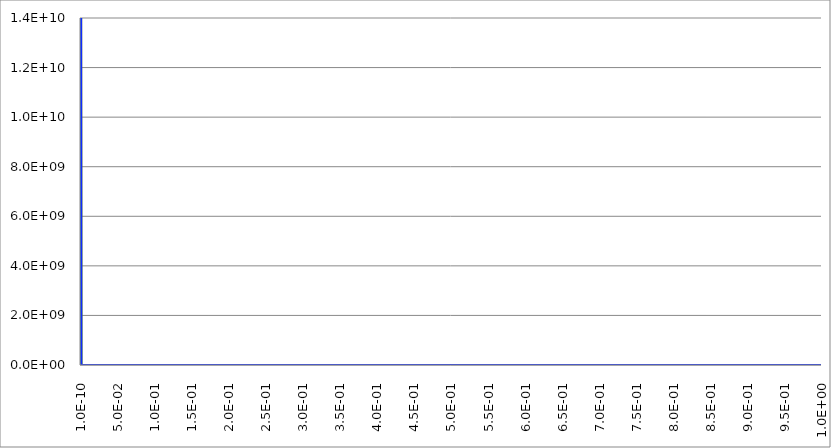
| Category | Series 1 | Series 0 | Series 2 |
|---|---|---|---|
| 1e-10 | 20000000000 | 20000000000 | 20000000000 |
| 0.00050000009995 | 326.933 | 368.54 | 410.147 |
| 0.0010000000999 | 20.619 | 23.219 | 25.82 |
| 0.00150000009985 | 4.085 | 4.599 | 5.113 |
| 0.0020000000998 | 1.294 | 1.457 | 1.62 |
| 0.00250000009975 | 0.531 | 0.597 | 0.664 |
| 0.0030000000997 | 0.256 | 0.288 | 0.32 |
| 0.00350000009965 | 0.138 | 0.156 | 0.173 |
| 0.0040000000996 | 0.081 | 0.091 | 0.101 |
| 0.00450000009955 | 0.051 | 0.057 | 0.063 |
| 0.0050000000995 | 0.033 | 0.037 | 0.042 |
| 0.00550000009945 | 0.023 | 0.026 | 0.028 |
| 0.0060000000994 | 0.016 | 0.018 | 0.02 |
| 0.00650000009935 | 0.012 | 0.013 | 0.015 |
| 0.0070000000993 | 0.009 | 0.01 | 0.011 |
| 0.00750000009925 | 0.007 | 0.007 | 0.008 |
| 0.0080000000992 | 0.005 | 0.006 | 0.006 |
| 0.00850000009915 | 0.004 | 0.004 | 0.005 |
| 0.0090000000991 | 0.003 | 0.004 | 0.004 |
| 0.00950000009905 | 0.003 | 0.003 | 0.003 |
| 0.010000000099 | 0.002 | 0.002 | 0.003 |
| 0.01050000009895 | 0.002 | 0.002 | 0.002 |
| 0.0110000000989 | 0.001 | 0.002 | 0.002 |
| 0.01150000009885 | 0.001 | 0.001 | 0.001 |
| 0.0120000000988 | 0.001 | 0.001 | 0.001 |
| 0.01250000009875 | 0.001 | 0.001 | 0.001 |
| 0.0130000000987 | 0.001 | 0.001 | 0.001 |
| 0.01350000009865 | 0.001 | 0.001 | 0.001 |
| 0.0140000000986 | 0.001 | 0.001 | 0.001 |
| 0.01450000009855 | 0 | 0.001 | 0.001 |
| 0.0150000000985 | 0 | 0 | 0.001 |
| 0.01550000009845 | 0 | 0 | 0 |
| 0.0160000000984 | 0 | 0 | 0 |
| 0.01650000009835 | 0 | 0 | 0 |
| 0.0170000000983 | 0 | 0 | 0 |
| 0.01750000009825 | 0 | 0 | 0 |
| 0.0180000000982 | 0 | 0 | 0 |
| 0.01850000009815 | 0 | 0 | 0 |
| 0.0190000000981 | 0 | 0 | 0 |
| 0.01950000009805 | 0 | 0 | 0 |
| 0.020000000098 | 0 | 0 | 0 |
| 0.02050000009795 | 0 | 0 | 0 |
| 0.0210000000979 | 0 | 0 | 0 |
| 0.02150000009785 | 0 | 0 | 0 |
| 0.0220000000978 | 0 | 0 | 0 |
| 0.02250000009775 | 0 | 0 | 0 |
| 0.0230000000977 | 0 | 0 | 0 |
| 0.02350000009765 | 0 | 0 | 0 |
| 0.0240000000976 | 0 | 0 | 0 |
| 0.02450000009755 | 0 | 0 | 0 |
| 0.0250000000975 | 0 | 0 | 0 |
| 0.02550000009745 | 0 | 0 | 0 |
| 0.0260000000974 | 0 | 0 | 0 |
| 0.02650000009735 | 0 | 0 | 0 |
| 0.0270000000973 | 0 | 0 | 0 |
| 0.02750000009725 | 0 | 0 | 0 |
| 0.0280000000972 | 0 | 0 | 0 |
| 0.02850000009715 | 0 | 0 | 0 |
| 0.0290000000971 | 0 | 0 | 0 |
| 0.02950000009705 | 0 | 0 | 0 |
| 0.030000000097 | 0 | 0 | 0 |
| 0.03050000009695 | 0 | 0 | 0 |
| 0.0310000000969 | 0 | 0 | 0 |
| 0.03150000009685 | 0 | 0 | 0 |
| 0.0320000000968 | 0 | 0 | 0 |
| 0.03250000009675 | 0 | 0 | 0 |
| 0.0330000000967 | 0 | 0 | 0 |
| 0.03350000009665 | 0 | 0 | 0 |
| 0.0340000000966 | 0 | 0 | 0 |
| 0.03450000009655 | 0 | 0 | 0 |
| 0.0350000000965 | 0 | 0 | 0 |
| 0.0355000000964499 | 0 | 0 | 0 |
| 0.0360000000963999 | 0 | 0 | 0 |
| 0.0365000000963499 | 0 | 0 | 0 |
| 0.0370000000962999 | 0 | 0 | 0 |
| 0.0375000000962499 | 0 | 0 | 0 |
| 0.0380000000961999 | 0 | 0 | 0 |
| 0.0385000000961499 | 0 | 0 | 0 |
| 0.0390000000960999 | 0 | 0 | 0 |
| 0.0395000000960499 | 0 | 0 | 0 |
| 0.0400000000959999 | 0 | 0 | 0 |
| 0.0405000000959499 | 0 | 0 | 0 |
| 0.0410000000958999 | 0 | 0 | 0 |
| 0.0415000000958499 | 0 | 0 | 0 |
| 0.0420000000957999 | 0 | 0 | 0 |
| 0.0425000000957499 | 0 | 0 | 0 |
| 0.0430000000956999 | 0 | 0 | 0 |
| 0.0435000000956499 | 0 | 0 | 0 |
| 0.0440000000955999 | 0 | 0 | 0 |
| 0.0445000000955499 | 0 | 0 | 0 |
| 0.0450000000954999 | 0 | 0 | 0 |
| 0.0455000000954499 | 0 | 0 | 0 |
| 0.0460000000953999 | 0 | 0 | 0 |
| 0.0465000000953499 | 0 | 0 | 0 |
| 0.0470000000952999 | 0 | 0 | 0 |
| 0.0475000000952499 | 0 | 0 | 0 |
| 0.0480000000951999 | 0 | 0 | 0 |
| 0.0485000000951499 | 0 | 0 | 0 |
| 0.0490000000950999 | 0 | 0 | 0 |
| 0.0495000000950499 | 0 | 0 | 0 |
| 0.0500000000949999 | 0 | 0 | 0 |
| 0.0505000000949499 | 0 | 0 | 0 |
| 0.0510000000948999 | 0 | 0 | 0 |
| 0.0515000000948499 | 0 | 0 | 0 |
| 0.0520000000947999 | 0 | 0 | 0 |
| 0.0525000000947499 | 0 | 0 | 0 |
| 0.0530000000946999 | 0 | 0 | 0 |
| 0.0535000000946499 | 0 | 0 | 0 |
| 0.0540000000945999 | 0 | 0 | 0 |
| 0.0545000000945499 | 0 | 0 | 0 |
| 0.0550000000944999 | 0 | 0 | 0 |
| 0.0555000000944499 | 0 | 0 | 0 |
| 0.0560000000943999 | 0 | 0 | 0 |
| 0.0565000000943499 | 0 | 0 | 0 |
| 0.0570000000942999 | 0 | 0 | 0 |
| 0.0575000000942499 | 0 | 0 | 0 |
| 0.0580000000941999 | 0 | 0 | 0 |
| 0.0585000000941499 | 0 | 0 | 0 |
| 0.0590000000940999 | 0 | 0 | 0 |
| 0.0595000000940499 | 0 | 0 | 0 |
| 0.0600000000939999 | 0 | 0 | 0 |
| 0.0605000000939499 | 0 | 0 | 0 |
| 0.0610000000938999 | 0 | 0 | 0 |
| 0.0615000000938499 | 0 | 0 | 0 |
| 0.0620000000937999 | 0 | 0 | 0 |
| 0.0625000000937499 | 0 | 0 | 0 |
| 0.0630000000936999 | 0 | 0 | 0 |
| 0.0635000000936499 | 0 | 0 | 0 |
| 0.0640000000935999 | 0 | 0 | 0 |
| 0.0645000000935499 | 0 | 0 | 0 |
| 0.0650000000934999 | 0 | 0 | 0 |
| 0.0655000000934499 | 0 | 0 | 0 |
| 0.0660000000933999 | 0 | 0 | 0 |
| 0.0665000000933499 | 0 | 0 | 0 |
| 0.0670000000932999 | 0 | 0 | 0 |
| 0.0675000000932499 | 0 | 0 | 0 |
| 0.0680000000931999 | 0 | 0 | 0 |
| 0.0685000000931499 | 0 | 0 | 0 |
| 0.0690000000930999 | 0 | 0 | 0 |
| 0.0695000000930499 | 0 | 0 | 0 |
| 0.0700000000929999 | 0 | 0 | 0 |
| 0.0705000000929499 | 0 | 0 | 0 |
| 0.0710000000928999 | 0 | 0 | 0 |
| 0.0715000000928499 | 0 | 0 | 0 |
| 0.0720000000927999 | 0 | 0 | 0 |
| 0.0725000000927499 | 0 | 0 | 0 |
| 0.0730000000926999 | 0 | 0 | 0 |
| 0.0735000000926499 | 0 | 0 | 0 |
| 0.0740000000925999 | 0 | 0 | 0 |
| 0.0745000000925499 | 0 | 0 | 0 |
| 0.0750000000924999 | 0 | 0 | 0 |
| 0.0755000000924499 | 0 | 0 | 0 |
| 0.0760000000923999 | 0 | 0 | 0 |
| 0.0765000000923499 | 0 | 0 | 0 |
| 0.0770000000922999 | 0 | 0 | 0 |
| 0.0775000000922499 | 0 | 0 | 0 |
| 0.0780000000921999 | 0 | 0 | 0 |
| 0.0785000000921498 | 0 | 0 | 0 |
| 0.0790000000920998 | 0 | 0 | 0 |
| 0.0795000000920498 | 0 | 0 | 0 |
| 0.0800000000919998 | 0 | 0 | 0 |
| 0.0805000000919498 | 0 | 0 | 0 |
| 0.0810000000918998 | 0 | 0 | 0 |
| 0.0815000000918498 | 0 | 0 | 0 |
| 0.0820000000917998 | 0 | 0 | 0 |
| 0.0825000000917498 | 0 | 0 | 0 |
| 0.0830000000916998 | 0 | 0 | 0 |
| 0.0835000000916498 | 0 | 0 | 0 |
| 0.0840000000915998 | 0 | 0 | 0 |
| 0.0845000000915498 | 0 | 0 | 0 |
| 0.0850000000914998 | 0 | 0 | 0 |
| 0.0855000000914498 | 0 | 0 | 0 |
| 0.0860000000913998 | 0 | 0 | 0 |
| 0.0865000000913498 | 0 | 0 | 0 |
| 0.0870000000912998 | 0 | 0 | 0 |
| 0.0875000000912498 | 0 | 0 | 0 |
| 0.0880000000911998 | 0 | 0 | 0 |
| 0.0885000000911498 | 0 | 0 | 0 |
| 0.0890000000910998 | 0 | 0 | 0 |
| 0.0895000000910498 | 0 | 0 | 0 |
| 0.0900000000909998 | 0 | 0 | 0 |
| 0.0905000000909498 | 0 | 0 | 0 |
| 0.0910000000908998 | 0 | 0 | 0 |
| 0.0915000000908498 | 0 | 0 | 0 |
| 0.0920000000907998 | 0 | 0 | 0 |
| 0.0925000000907498 | 0 | 0 | 0 |
| 0.0930000000906998 | 0 | 0 | 0 |
| 0.0935000000906498 | 0 | 0 | 0 |
| 0.0940000000905998 | 0 | 0 | 0 |
| 0.0945000000905498 | 0 | 0 | 0 |
| 0.0950000000904998 | 0 | 0 | 0 |
| 0.0955000000904498 | 0 | 0 | 0 |
| 0.0960000000903998 | 0 | 0 | 0 |
| 0.0965000000903498 | 0 | 0 | 0 |
| 0.0970000000902998 | 0 | 0 | 0 |
| 0.0975000000902498 | 0 | 0 | 0 |
| 0.0980000000901998 | 0 | 0 | 0 |
| 0.0985000000901498 | 0 | 0 | 0 |
| 0.0990000000900998 | 0 | 0 | 0 |
| 0.0995000000900498 | 0 | 0 | 0 |
| 0.10000000009 | 0 | 0 | 0 |
| 0.10050000008995 | 0 | 0 | 0 |
| 0.1010000000899 | 0 | 0 | 0 |
| 0.10150000008985 | 0 | 0 | 0 |
| 0.1020000000898 | 0 | 0 | 0 |
| 0.10250000008975 | 0 | 0 | 0 |
| 0.1030000000897 | 0 | 0 | 0 |
| 0.10350000008965 | 0 | 0 | 0 |
| 0.1040000000896 | 0 | 0 | 0 |
| 0.10450000008955 | 0 | 0 | 0 |
| 0.1050000000895 | 0 | 0 | 0 |
| 0.10550000008945 | 0 | 0 | 0 |
| 0.1060000000894 | 0 | 0 | 0 |
| 0.10650000008935 | 0 | 0 | 0 |
| 0.1070000000893 | 0 | 0 | 0 |
| 0.10750000008925 | 0 | 0 | 0 |
| 0.1080000000892 | 0 | 0 | 0 |
| 0.10850000008915 | 0 | 0 | 0 |
| 0.1090000000891 | 0 | 0 | 0 |
| 0.10950000008905 | 0 | 0 | 0 |
| 0.110000000089 | 0 | 0 | 0 |
| 0.11050000008895 | 0 | 0 | 0 |
| 0.1110000000889 | 0 | 0 | 0 |
| 0.11150000008885 | 0 | 0 | 0 |
| 0.1120000000888 | 0 | 0 | 0 |
| 0.11250000008875 | 0 | 0 | 0 |
| 0.1130000000887 | 0 | 0 | 0 |
| 0.11350000008865 | 0 | 0 | 0 |
| 0.1140000000886 | 0 | 0 | 0 |
| 0.11450000008855 | 0 | 0 | 0 |
| 0.1150000000885 | 0 | 0 | 0 |
| 0.11550000008845 | 0 | 0 | 0 |
| 0.1160000000884 | 0 | 0 | 0 |
| 0.11650000008835 | 0 | 0 | 0 |
| 0.1170000000883 | 0 | 0 | 0 |
| 0.11750000008825 | 0 | 0 | 0 |
| 0.1180000000882 | 0 | 0 | 0 |
| 0.11850000008815 | 0 | 0 | 0 |
| 0.1190000000881 | 0 | 0 | 0 |
| 0.11950000008805 | 0 | 0 | 0 |
| 0.120000000088 | 0 | 0 | 0 |
| 0.12050000008795 | 0 | 0 | 0 |
| 0.1210000000879 | 0 | 0 | 0 |
| 0.12150000008785 | 0 | 0 | 0 |
| 0.1220000000878 | 0 | 0 | 0 |
| 0.12250000008775 | 0 | 0 | 0 |
| 0.1230000000877 | 0 | 0 | 0 |
| 0.12350000008765 | 0 | 0 | 0 |
| 0.1240000000876 | 0 | 0 | 0 |
| 0.12450000008755 | 0 | 0 | 0 |
| 0.1250000000875 | 0 | 0 | 0 |
| 0.12550000008745 | 0 | 0 | 0 |
| 0.1260000000874 | 0 | 0 | 0 |
| 0.12650000008735 | 0 | 0 | 0 |
| 0.1270000000873 | 0 | 0 | 0 |
| 0.12750000008725 | 0 | 0 | 0 |
| 0.1280000000872 | 0 | 0 | 0 |
| 0.12850000008715 | 0 | 0 | 0 |
| 0.1290000000871 | 0 | 0 | 0 |
| 0.12950000008705 | 0 | 0 | 0 |
| 0.130000000087 | 0 | 0 | 0 |
| 0.13050000008695 | 0 | 0 | 0 |
| 0.1310000000869 | 0 | 0 | 0 |
| 0.13150000008685 | 0 | 0 | 0 |
| 0.1320000000868 | 0 | 0 | 0 |
| 0.13250000008675 | 0 | 0 | 0 |
| 0.1330000000867 | 0 | 0 | 0 |
| 0.13350000008665 | 0 | 0 | 0 |
| 0.1340000000866 | 0 | 0 | 0 |
| 0.13450000008655 | 0 | 0 | 0 |
| 0.1350000000865 | 0 | 0 | 0 |
| 0.13550000008645 | 0 | 0 | 0 |
| 0.1360000000864 | 0 | 0 | 0 |
| 0.13650000008635 | 0 | 0 | 0 |
| 0.1370000000863 | 0 | 0 | 0 |
| 0.13750000008625 | 0 | 0 | 0 |
| 0.1380000000862 | 0 | 0 | 0 |
| 0.13850000008615 | 0 | 0 | 0 |
| 0.1390000000861 | 0 | 0 | 0 |
| 0.13950000008605 | 0 | 0 | 0 |
| 0.140000000086 | 0 | 0 | 0 |
| 0.14050000008595 | 0 | 0 | 0 |
| 0.1410000000859 | 0 | 0 | 0 |
| 0.14150000008585 | 0 | 0 | 0 |
| 0.1420000000858 | 0 | 0 | 0 |
| 0.14250000008575 | 0 | 0 | 0 |
| 0.1430000000857 | 0 | 0 | 0 |
| 0.14350000008565 | 0 | 0 | 0 |
| 0.1440000000856 | 0 | 0 | 0 |
| 0.14450000008555 | 0 | 0 | 0 |
| 0.1450000000855 | 0 | 0 | 0 |
| 0.14550000008545 | 0 | 0 | 0 |
| 0.1460000000854 | 0 | 0 | 0 |
| 0.14650000008535 | 0 | 0 | 0 |
| 0.1470000000853 | 0 | 0 | 0 |
| 0.14750000008525 | 0 | 0 | 0 |
| 0.1480000000852 | 0 | 0 | 0 |
| 0.14850000008515 | 0 | 0 | 0 |
| 0.1490000000851 | 0 | 0 | 0 |
| 0.14950000008505 | 0 | 0 | 0 |
| 0.150000000085 | 0 | 0 | 0 |
| 0.15050000008495 | 0 | 0 | 0 |
| 0.1510000000849 | 0 | 0 | 0 |
| 0.15150000008485 | 0 | 0 | 0 |
| 0.1520000000848 | 0 | 0 | 0 |
| 0.15250000008475 | 0 | 0 | 0 |
| 0.1530000000847 | 0 | 0 | 0 |
| 0.15350000008465 | 0 | 0 | 0 |
| 0.1540000000846 | 0 | 0 | 0 |
| 0.15450000008455 | 0 | 0 | 0 |
| 0.155000000084501 | 0 | 0 | 0 |
| 0.155500000084451 | 0 | 0 | 0 |
| 0.156000000084401 | 0 | 0 | 0 |
| 0.156500000084351 | 0 | 0 | 0 |
| 0.157000000084301 | 0 | 0 | 0 |
| 0.157500000084251 | 0 | 0 | 0 |
| 0.158000000084201 | 0 | 0 | 0 |
| 0.158500000084151 | 0 | 0 | 0 |
| 0.159000000084101 | 0 | 0 | 0 |
| 0.159500000084051 | 0 | 0 | 0 |
| 0.160000000084001 | 0 | 0 | 0 |
| 0.160500000083951 | 0 | 0 | 0 |
| 0.161000000083901 | 0 | 0 | 0 |
| 0.161500000083851 | 0 | 0 | 0 |
| 0.162000000083801 | 0 | 0 | 0 |
| 0.162500000083751 | 0 | 0 | 0 |
| 0.163000000083701 | 0 | 0 | 0 |
| 0.163500000083651 | 0 | 0 | 0 |
| 0.164000000083601 | 0 | 0 | 0 |
| 0.164500000083551 | 0 | 0 | 0 |
| 0.165000000083501 | 0 | 0 | 0 |
| 0.165500000083451 | 0 | 0 | 0 |
| 0.166000000083401 | 0 | 0 | 0 |
| 0.166500000083351 | 0 | 0 | 0 |
| 0.167000000083301 | 0 | 0 | 0 |
| 0.167500000083251 | 0 | 0 | 0 |
| 0.168000000083201 | 0 | 0 | 0 |
| 0.168500000083151 | 0 | 0 | 0 |
| 0.169000000083101 | 0 | 0 | 0 |
| 0.169500000083051 | 0 | 0 | 0 |
| 0.170000000083001 | 0 | 0 | 0 |
| 0.170500000082951 | 0 | 0 | 0 |
| 0.171000000082901 | 0 | 0 | 0 |
| 0.171500000082851 | 0 | 0 | 0 |
| 0.172000000082801 | 0 | 0 | 0 |
| 0.172500000082751 | 0 | 0 | 0 |
| 0.173000000082701 | 0 | 0 | 0 |
| 0.173500000082651 | 0 | 0 | 0 |
| 0.174000000082601 | 0 | 0 | 0 |
| 0.174500000082551 | 0 | 0 | 0 |
| 0.175000000082501 | 0 | 0 | 0 |
| 0.175500000082451 | 0 | 0 | 0 |
| 0.176000000082401 | 0 | 0 | 0 |
| 0.176500000082351 | 0 | 0 | 0 |
| 0.177000000082301 | 0 | 0 | 0 |
| 0.177500000082251 | 0 | 0 | 0 |
| 0.178000000082201 | 0 | 0 | 0 |
| 0.178500000082151 | 0 | 0 | 0 |
| 0.179000000082101 | 0 | 0 | 0 |
| 0.179500000082051 | 0 | 0 | 0 |
| 0.180000000082001 | 0 | 0 | 0 |
| 0.180500000081951 | 0 | 0 | 0 |
| 0.181000000081901 | 0 | 0 | 0 |
| 0.181500000081851 | 0 | 0 | 0 |
| 0.182000000081801 | 0 | 0 | 0 |
| 0.182500000081751 | 0 | 0 | 0 |
| 0.183000000081701 | 0 | 0 | 0 |
| 0.183500000081651 | 0 | 0 | 0 |
| 0.184000000081601 | 0 | 0 | 0 |
| 0.184500000081551 | 0 | 0 | 0 |
| 0.185000000081501 | 0 | 0 | 0 |
| 0.185500000081451 | 0 | 0 | 0 |
| 0.186000000081401 | 0 | 0 | 0 |
| 0.186500000081351 | 0 | 0 | 0 |
| 0.187000000081301 | 0 | 0 | 0 |
| 0.187500000081251 | 0 | 0 | 0 |
| 0.188000000081201 | 0 | 0 | 0 |
| 0.188500000081151 | 0 | 0 | 0 |
| 0.189000000081101 | 0 | 0 | 0 |
| 0.189500000081051 | 0 | 0 | 0 |
| 0.190000000081001 | 0 | 0 | 0 |
| 0.190500000080951 | 0 | 0 | 0 |
| 0.191000000080901 | 0 | 0 | 0 |
| 0.191500000080851 | 0 | 0 | 0 |
| 0.192000000080801 | 0 | 0 | 0 |
| 0.192500000080751 | 0 | 0 | 0 |
| 0.193000000080701 | 0 | 0 | 0 |
| 0.193500000080651 | 0 | 0 | 0 |
| 0.194000000080601 | 0 | 0 | 0 |
| 0.194500000080551 | 0 | 0 | 0 |
| 0.195000000080501 | 0 | 0 | 0 |
| 0.195500000080452 | 0 | 0 | 0 |
| 0.196000000080402 | 0 | 0 | 0 |
| 0.196500000080352 | 0 | 0 | 0 |
| 0.197000000080302 | 0 | 0 | 0 |
| 0.197500000080252 | 0 | 0 | 0 |
| 0.198000000080202 | 0 | 0 | 0 |
| 0.198500000080152 | 0 | 0 | 0 |
| 0.199000000080102 | 0 | 0 | 0 |
| 0.199500000080052 | 0 | 0 | 0 |
| 0.200000000080002 | 0 | 0 | 0 |
| 0.200500000079952 | 0 | 0 | 0 |
| 0.201000000079902 | 0 | 0 | 0 |
| 0.201500000079852 | 0 | 0 | 0 |
| 0.202000000079802 | 0 | 0 | 0 |
| 0.202500000079752 | 0 | 0 | 0 |
| 0.203000000079702 | 0 | 0 | 0 |
| 0.203500000079652 | 0 | 0 | 0 |
| 0.204000000079602 | 0 | 0 | 0 |
| 0.204500000079552 | 0 | 0 | 0 |
| 0.205000000079502 | 0 | 0 | 0 |
| 0.205500000079452 | 0 | 0 | 0 |
| 0.206000000079402 | 0 | 0 | 0 |
| 0.206500000079352 | 0 | 0 | 0 |
| 0.207000000079302 | 0 | 0 | 0 |
| 0.207500000079252 | 0 | 0 | 0 |
| 0.208000000079202 | 0 | 0 | 0 |
| 0.208500000079152 | 0 | 0 | 0 |
| 0.209000000079102 | 0 | 0 | 0 |
| 0.209500000079052 | 0 | 0 | 0 |
| 0.210000000079002 | 0 | 0 | 0 |
| 0.210500000078952 | 0 | 0 | 0 |
| 0.211000000078902 | 0 | 0 | 0 |
| 0.211500000078852 | 0 | 0 | 0 |
| 0.212000000078802 | 0 | 0 | 0 |
| 0.212500000078752 | 0 | 0 | 0 |
| 0.213000000078702 | 0 | 0 | 0 |
| 0.213500000078652 | 0 | 0 | 0 |
| 0.214000000078602 | 0 | 0 | 0 |
| 0.214500000078552 | 0 | 0 | 0 |
| 0.215000000078502 | 0 | 0 | 0 |
| 0.215500000078452 | 0 | 0 | 0 |
| 0.216000000078402 | 0 | 0 | 0 |
| 0.216500000078352 | 0 | 0 | 0 |
| 0.217000000078302 | 0 | 0 | 0 |
| 0.217500000078252 | 0 | 0 | 0 |
| 0.218000000078202 | 0 | 0 | 0 |
| 0.218500000078152 | 0 | 0 | 0 |
| 0.219000000078102 | 0 | 0 | 0 |
| 0.219500000078052 | 0 | 0 | 0 |
| 0.220000000078002 | 0 | 0 | 0 |
| 0.220500000077952 | 0 | 0 | 0 |
| 0.221000000077902 | 0 | 0 | 0 |
| 0.221500000077852 | 0 | 0 | 0 |
| 0.222000000077802 | 0 | 0 | 0 |
| 0.222500000077752 | 0 | 0 | 0 |
| 0.223000000077702 | 0 | 0 | 0 |
| 0.223500000077652 | 0 | 0 | 0 |
| 0.224000000077602 | 0 | 0 | 0 |
| 0.224500000077552 | 0 | 0 | 0 |
| 0.225000000077502 | 0 | 0 | 0 |
| 0.225500000077452 | 0 | 0 | 0 |
| 0.226000000077402 | 0 | 0 | 0 |
| 0.226500000077352 | 0 | 0 | 0 |
| 0.227000000077302 | 0 | 0 | 0 |
| 0.227500000077252 | 0 | 0 | 0 |
| 0.228000000077202 | 0 | 0 | 0 |
| 0.228500000077152 | 0 | 0 | 0 |
| 0.229000000077102 | 0 | 0 | 0 |
| 0.229500000077052 | 0 | 0 | 0 |
| 0.230000000077002 | 0 | 0 | 0 |
| 0.230500000076952 | 0 | 0 | 0 |
| 0.231000000076902 | 0 | 0 | 0 |
| 0.231500000076852 | 0 | 0 | 0 |
| 0.232000000076802 | 0 | 0 | 0 |
| 0.232500000076752 | 0 | 0 | 0 |
| 0.233000000076702 | 0 | 0 | 0 |
| 0.233500000076652 | 0 | 0 | 0 |
| 0.234000000076602 | 0 | 0 | 0 |
| 0.234500000076553 | 0 | 0 | 0 |
| 0.235000000076503 | 0 | 0 | 0 |
| 0.235500000076453 | 0 | 0 | 0 |
| 0.236000000076403 | 0 | 0 | 0 |
| 0.236500000076353 | 0 | 0 | 0 |
| 0.237000000076303 | 0 | 0 | 0 |
| 0.237500000076253 | 0 | 0 | 0 |
| 0.238000000076203 | 0 | 0 | 0 |
| 0.238500000076153 | 0 | 0 | 0 |
| 0.239000000076103 | 0 | 0 | 0 |
| 0.239500000076053 | 0 | 0 | 0 |
| 0.240000000076003 | 0 | 0 | 0 |
| 0.240500000075953 | 0 | 0 | 0 |
| 0.241000000075903 | 0 | 0 | 0 |
| 0.241500000075853 | 0 | 0 | 0 |
| 0.242000000075803 | 0 | 0 | 0 |
| 0.242500000075753 | 0 | 0 | 0 |
| 0.243000000075703 | 0 | 0 | 0 |
| 0.243500000075653 | 0 | 0 | 0 |
| 0.244000000075603 | 0 | 0 | 0 |
| 0.244500000075553 | 0 | 0 | 0 |
| 0.245000000075503 | 0 | 0 | 0 |
| 0.245500000075453 | 0 | 0 | 0 |
| 0.246000000075403 | 0 | 0 | 0 |
| 0.246500000075353 | 0 | 0 | 0 |
| 0.247000000075303 | 0 | 0 | 0 |
| 0.247500000075253 | 0 | 0 | 0 |
| 0.248000000075203 | 0 | 0 | 0 |
| 0.248500000075153 | 0 | 0 | 0 |
| 0.249000000075103 | 0 | 0 | 0 |
| 0.249500000075053 | 0 | 0 | 0 |
| 0.250000000075003 | 0 | 0 | 0 |
| 0.250500000074953 | 0 | 0 | 0 |
| 0.251000000074903 | 0 | 0 | 0 |
| 0.251500000074853 | 0 | 0 | 0 |
| 0.252000000074803 | 0 | 0 | 0 |
| 0.252500000074753 | 0 | 0 | 0 |
| 0.253000000074703 | 0 | 0 | 0 |
| 0.253500000074653 | 0 | 0 | 0 |
| 0.254000000074603 | 0 | 0 | 0 |
| 0.254500000074553 | 0 | 0 | 0 |
| 0.255000000074503 | 0 | 0 | 0 |
| 0.255500000074453 | 0 | 0 | 0 |
| 0.256000000074403 | 0 | 0 | 0 |
| 0.256500000074353 | 0 | 0 | 0 |
| 0.257000000074303 | 0 | 0 | 0 |
| 0.257500000074253 | 0 | 0 | 0 |
| 0.258000000074203 | 0 | 0 | 0 |
| 0.258500000074153 | 0 | 0 | 0 |
| 0.259000000074103 | 0 | 0 | 0 |
| 0.259500000074053 | 0 | 0 | 0 |
| 0.260000000074003 | 0 | 0 | 0 |
| 0.260500000073953 | 0 | 0 | 0 |
| 0.261000000073903 | 0 | 0 | 0 |
| 0.261500000073853 | 0 | 0 | 0 |
| 0.262000000073803 | 0 | 0 | 0 |
| 0.262500000073752 | 0 | 0 | 0 |
| 0.263000000073702 | 0 | 0 | 0 |
| 0.263500000073652 | 0 | 0 | 0 |
| 0.264000000073602 | 0 | 0 | 0 |
| 0.264500000073552 | 0 | 0 | 0 |
| 0.265000000073502 | 0 | 0 | 0 |
| 0.265500000073452 | 0 | 0 | 0 |
| 0.266000000073402 | 0 | 0 | 0 |
| 0.266500000073352 | 0 | 0 | 0 |
| 0.267000000073302 | 0 | 0 | 0 |
| 0.267500000073252 | 0 | 0 | 0 |
| 0.268000000073202 | 0 | 0 | 0 |
| 0.268500000073152 | 0 | 0 | 0 |
| 0.269000000073102 | 0 | 0 | 0 |
| 0.269500000073052 | 0 | 0 | 0 |
| 0.270000000073002 | 0 | 0 | 0 |
| 0.270500000072952 | 0 | 0 | 0 |
| 0.271000000072902 | 0 | 0 | 0 |
| 0.271500000072852 | 0 | 0 | 0 |
| 0.272000000072802 | 0 | 0 | 0 |
| 0.272500000072752 | 0 | 0 | 0 |
| 0.273000000072702 | 0 | 0 | 0 |
| 0.273500000072652 | 0 | 0 | 0 |
| 0.274000000072602 | 0 | 0 | 0 |
| 0.274500000072552 | 0 | 0 | 0 |
| 0.275000000072502 | 0 | 0 | 0 |
| 0.275500000072452 | 0 | 0 | 0 |
| 0.276000000072402 | 0 | 0 | 0 |
| 0.276500000072352 | 0 | 0 | 0 |
| 0.277000000072302 | 0 | 0 | 0 |
| 0.277500000072252 | 0 | 0 | 0 |
| 0.278000000072202 | 0 | 0 | 0 |
| 0.278500000072152 | 0 | 0 | 0 |
| 0.279000000072102 | 0 | 0 | 0 |
| 0.279500000072052 | 0 | 0 | 0 |
| 0.280000000072002 | 0 | 0 | 0 |
| 0.280500000071952 | 0 | 0 | 0 |
| 0.281000000071902 | 0 | 0 | 0 |
| 0.281500000071852 | 0 | 0 | 0 |
| 0.282000000071802 | 0 | 0 | 0 |
| 0.282500000071752 | 0 | 0 | 0 |
| 0.283000000071702 | 0 | 0 | 0 |
| 0.283500000071652 | 0 | 0 | 0 |
| 0.284000000071602 | 0 | 0 | 0 |
| 0.284500000071552 | 0 | 0 | 0 |
| 0.285000000071502 | 0 | 0 | 0 |
| 0.285500000071452 | 0 | 0 | 0 |
| 0.286000000071402 | 0 | 0 | 0 |
| 0.286500000071352 | 0 | 0 | 0 |
| 0.287000000071302 | 0 | 0 | 0 |
| 0.287500000071252 | 0 | 0 | 0 |
| 0.288000000071202 | 0 | 0 | 0 |
| 0.288500000071152 | 0 | 0 | 0 |
| 0.289000000071102 | 0 | 0 | 0 |
| 0.289500000071052 | 0 | 0 | 0 |
| 0.290000000071002 | 0 | 0 | 0 |
| 0.290500000070952 | 0 | 0 | 0 |
| 0.291000000070902 | 0 | 0 | 0 |
| 0.291500000070852 | 0 | 0 | 0 |
| 0.292000000070802 | 0 | 0 | 0 |
| 0.292500000070752 | 0 | 0 | 0 |
| 0.293000000070702 | 0 | 0 | 0 |
| 0.293500000070652 | 0 | 0 | 0 |
| 0.294000000070602 | 0 | 0 | 0 |
| 0.294500000070552 | 0 | 0 | 0 |
| 0.295000000070501 | 0 | 0 | 0 |
| 0.295500000070451 | 0 | 0 | 0 |
| 0.296000000070401 | 0 | 0 | 0 |
| 0.296500000070351 | 0 | 0 | 0 |
| 0.297000000070301 | 0 | 0 | 0 |
| 0.297500000070251 | 0 | 0 | 0 |
| 0.298000000070201 | 0 | 0 | 0 |
| 0.298500000070151 | 0 | 0 | 0 |
| 0.299000000070101 | 0 | 0 | 0 |
| 0.299500000070051 | 0 | 0 | 0 |
| 0.300000000070001 | 0 | 0 | 0 |
| 0.300500000069951 | 0 | 0 | 0 |
| 0.301000000069901 | 0 | 0 | 0 |
| 0.301500000069851 | 0 | 0 | 0 |
| 0.302000000069801 | 0 | 0 | 0 |
| 0.302500000069751 | 0 | 0 | 0 |
| 0.303000000069701 | 0 | 0 | 0 |
| 0.303500000069651 | 0 | 0 | 0 |
| 0.304000000069601 | 0 | 0 | 0 |
| 0.304500000069551 | 0 | 0 | 0 |
| 0.305000000069501 | 0 | 0 | 0 |
| 0.305500000069451 | 0 | 0 | 0 |
| 0.306000000069401 | 0 | 0 | 0 |
| 0.306500000069351 | 0 | 0 | 0 |
| 0.307000000069301 | 0 | 0 | 0 |
| 0.307500000069251 | 0 | 0 | 0 |
| 0.308000000069201 | 0 | 0 | 0 |
| 0.308500000069151 | 0 | 0 | 0 |
| 0.309000000069101 | 0 | 0 | 0 |
| 0.309500000069051 | 0 | 0 | 0 |
| 0.310000000069001 | 0 | 0 | 0 |
| 0.310500000068951 | 0 | 0 | 0 |
| 0.311000000068901 | 0 | 0 | 0 |
| 0.311500000068851 | 0 | 0 | 0 |
| 0.312000000068801 | 0 | 0 | 0 |
| 0.312500000068751 | 0 | 0 | 0 |
| 0.313000000068701 | 0 | 0 | 0 |
| 0.313500000068651 | 0 | 0 | 0 |
| 0.314000000068601 | 0 | 0 | 0 |
| 0.314500000068551 | 0 | 0 | 0 |
| 0.315000000068501 | 0 | 0 | 0 |
| 0.315500000068451 | 0 | 0 | 0 |
| 0.316000000068401 | 0 | 0 | 0 |
| 0.316500000068351 | 0 | 0 | 0 |
| 0.317000000068301 | 0 | 0 | 0 |
| 0.317500000068251 | 0 | 0 | 0 |
| 0.318000000068201 | 0 | 0 | 0 |
| 0.318500000068151 | 0 | 0 | 0 |
| 0.319000000068101 | 0 | 0 | 0 |
| 0.319500000068051 | 0 | 0 | 0 |
| 0.320000000068001 | 0 | 0 | 0 |
| 0.320500000067951 | 0 | 0 | 0 |
| 0.321000000067901 | 0 | 0 | 0 |
| 0.321500000067851 | 0 | 0 | 0 |
| 0.322000000067801 | 0 | 0 | 0 |
| 0.322500000067751 | 0 | 0 | 0 |
| 0.323000000067701 | 0 | 0 | 0 |
| 0.323500000067651 | 0 | 0 | 0 |
| 0.324000000067601 | 0 | 0 | 0 |
| 0.324500000067551 | 0 | 0 | 0 |
| 0.325000000067501 | 0 | 0 | 0 |
| 0.325500000067451 | 0 | 0 | 0 |
| 0.326000000067401 | 0 | 0 | 0 |
| 0.326500000067351 | 0 | 0 | 0 |
| 0.327000000067301 | 0 | 0 | 0 |
| 0.327500000067251 | 0 | 0 | 0 |
| 0.3280000000672 | 0 | 0 | 0 |
| 0.32850000006715 | 0 | 0 | 0 |
| 0.3290000000671 | 0 | 0 | 0 |
| 0.32950000006705 | 0 | 0 | 0 |
| 0.330000000067 | 0 | 0 | 0 |
| 0.33050000006695 | 0 | 0 | 0 |
| 0.3310000000669 | 0 | 0 | 0 |
| 0.33150000006685 | 0 | 0 | 0 |
| 0.3320000000668 | 0 | 0 | 0 |
| 0.33250000006675 | 0 | 0 | 0 |
| 0.3330000000667 | 0 | 0 | 0 |
| 0.33350000006665 | 0 | 0 | 0 |
| 0.3340000000666 | 0 | 0 | 0 |
| 0.33450000006655 | 0 | 0 | 0 |
| 0.3350000000665 | 0 | 0 | 0 |
| 0.33550000006645 | 0 | 0 | 0 |
| 0.3360000000664 | 0 | 0 | 0 |
| 0.33650000006635 | 0 | 0 | 0 |
| 0.3370000000663 | 0 | 0 | 0 |
| 0.33750000006625 | 0 | 0 | 0 |
| 0.3380000000662 | 0 | 0 | 0 |
| 0.33850000006615 | 0 | 0 | 0 |
| 0.3390000000661 | 0 | 0 | 0 |
| 0.33950000006605 | 0 | 0 | 0 |
| 0.340000000066 | 0 | 0 | 0 |
| 0.34050000006595 | 0 | 0 | 0 |
| 0.3410000000659 | 0 | 0 | 0 |
| 0.34150000006585 | 0 | 0 | 0 |
| 0.3420000000658 | 0 | 0 | 0 |
| 0.34250000006575 | 0 | 0 | 0 |
| 0.3430000000657 | 0 | 0 | 0 |
| 0.34350000006565 | 0 | 0 | 0 |
| 0.3440000000656 | 0 | 0 | 0 |
| 0.34450000006555 | 0 | 0 | 0 |
| 0.3450000000655 | 0 | 0 | 0 |
| 0.34550000006545 | 0 | 0 | 0 |
| 0.3460000000654 | 0 | 0 | 0 |
| 0.34650000006535 | 0 | 0 | 0 |
| 0.3470000000653 | 0 | 0 | 0 |
| 0.34750000006525 | 0 | 0 | 0 |
| 0.3480000000652 | 0 | 0 | 0 |
| 0.34850000006515 | 0 | 0 | 0 |
| 0.3490000000651 | 0 | 0 | 0 |
| 0.34950000006505 | 0 | 0 | 0 |
| 0.350000000065 | 0 | 0 | 0 |
| 0.35050000006495 | 0 | 0 | 0 |
| 0.3510000000649 | 0 | 0 | 0 |
| 0.35150000006485 | 0 | 0 | 0 |
| 0.3520000000648 | 0 | 0 | 0 |
| 0.35250000006475 | 0 | 0 | 0 |
| 0.3530000000647 | 0 | 0 | 0 |
| 0.35350000006465 | 0 | 0 | 0 |
| 0.3540000000646 | 0 | 0 | 0 |
| 0.35450000006455 | 0 | 0 | 0 |
| 0.3550000000645 | 0 | 0 | 0 |
| 0.35550000006445 | 0 | 0 | 0 |
| 0.3560000000644 | 0 | 0 | 0 |
| 0.35650000006435 | 0 | 0 | 0 |
| 0.3570000000643 | 0 | 0 | 0 |
| 0.35750000006425 | 0 | 0 | 0 |
| 0.3580000000642 | 0 | 0 | 0 |
| 0.35850000006415 | 0 | 0 | 0 |
| 0.3590000000641 | 0 | 0 | 0 |
| 0.35950000006405 | 0 | 0 | 0 |
| 0.360000000064 | 0 | 0 | 0 |
| 0.360500000063949 | 0 | 0 | 0 |
| 0.361000000063899 | 0 | 0 | 0 |
| 0.361500000063849 | 0 | 0 | 0 |
| 0.362000000063799 | 0 | 0 | 0 |
| 0.362500000063749 | 0 | 0 | 0 |
| 0.363000000063699 | 0 | 0 | 0 |
| 0.363500000063649 | 0 | 0 | 0 |
| 0.364000000063599 | 0 | 0 | 0 |
| 0.364500000063549 | 0 | 0 | 0 |
| 0.365000000063499 | 0 | 0 | 0 |
| 0.365500000063449 | 0 | 0 | 0 |
| 0.366000000063399 | 0 | 0 | 0 |
| 0.366500000063349 | 0 | 0 | 0 |
| 0.367000000063299 | 0 | 0 | 0 |
| 0.367500000063249 | 0 | 0 | 0 |
| 0.368000000063199 | 0 | 0 | 0 |
| 0.368500000063149 | 0 | 0 | 0 |
| 0.369000000063099 | 0 | 0 | 0 |
| 0.369500000063049 | 0 | 0 | 0 |
| 0.370000000062999 | 0 | 0 | 0 |
| 0.370500000062949 | 0 | 0 | 0 |
| 0.371000000062899 | 0 | 0 | 0 |
| 0.371500000062849 | 0 | 0 | 0 |
| 0.372000000062799 | 0 | 0 | 0 |
| 0.372500000062749 | 0 | 0 | 0 |
| 0.373000000062699 | 0 | 0 | 0 |
| 0.373500000062649 | 0 | 0 | 0 |
| 0.374000000062599 | 0 | 0 | 0 |
| 0.374500000062549 | 0 | 0 | 0 |
| 0.375000000062499 | 0 | 0 | 0 |
| 0.375500000062449 | 0 | 0 | 0 |
| 0.376000000062399 | 0 | 0 | 0 |
| 0.376500000062349 | 0 | 0 | 0 |
| 0.377000000062299 | 0 | 0 | 0 |
| 0.377500000062249 | 0 | 0 | 0 |
| 0.378000000062199 | 0 | 0 | 0 |
| 0.378500000062149 | 0 | 0 | 0 |
| 0.379000000062099 | 0 | 0 | 0 |
| 0.379500000062049 | 0 | 0 | 0 |
| 0.380000000061999 | 0 | 0 | 0 |
| 0.380500000061949 | 0 | 0 | 0 |
| 0.381000000061899 | 0 | 0 | 0 |
| 0.381500000061849 | 0 | 0 | 0 |
| 0.382000000061799 | 0 | 0 | 0 |
| 0.382500000061749 | 0 | 0 | 0 |
| 0.383000000061699 | 0 | 0 | 0 |
| 0.383500000061649 | 0 | 0 | 0 |
| 0.384000000061599 | 0 | 0 | 0 |
| 0.384500000061549 | 0 | 0 | 0 |
| 0.385000000061499 | 0 | 0 | 0 |
| 0.385500000061449 | 0 | 0 | 0 |
| 0.386000000061399 | 0 | 0 | 0 |
| 0.386500000061349 | 0 | 0 | 0 |
| 0.387000000061299 | 0 | 0 | 0 |
| 0.387500000061249 | 0 | 0 | 0 |
| 0.388000000061199 | 0 | 0 | 0 |
| 0.388500000061149 | 0 | 0 | 0 |
| 0.389000000061099 | 0 | 0 | 0 |
| 0.389500000061049 | 0 | 0 | 0 |
| 0.390000000060999 | 0 | 0 | 0 |
| 0.390500000060949 | 0 | 0 | 0 |
| 0.391000000060899 | 0 | 0 | 0 |
| 0.391500000060849 | 0 | 0 | 0 |
| 0.392000000060799 | 0 | 0 | 0 |
| 0.392500000060749 | 0 | 0 | 0 |
| 0.393000000060699 | 0 | 0 | 0 |
| 0.393500000060648 | 0 | 0 | 0 |
| 0.394000000060598 | 0 | 0 | 0 |
| 0.394500000060548 | 0 | 0 | 0 |
| 0.395000000060498 | 0 | 0 | 0 |
| 0.395500000060448 | 0 | 0 | 0 |
| 0.396000000060398 | 0 | 0 | 0 |
| 0.396500000060348 | 0 | 0 | 0 |
| 0.397000000060298 | 0 | 0 | 0 |
| 0.397500000060248 | 0 | 0 | 0 |
| 0.398000000060198 | 0 | 0 | 0 |
| 0.398500000060148 | 0 | 0 | 0 |
| 0.399000000060098 | 0 | 0 | 0 |
| 0.399500000060048 | 0 | 0 | 0 |
| 0.400000000059998 | 0 | 0 | 0 |
| 0.400500000059948 | 0 | 0 | 0 |
| 0.401000000059898 | 0 | 0 | 0 |
| 0.401500000059848 | 0 | 0 | 0 |
| 0.402000000059798 | 0 | 0 | 0 |
| 0.402500000059748 | 0 | 0 | 0 |
| 0.403000000059698 | 0 | 0 | 0 |
| 0.403500000059648 | 0 | 0 | 0 |
| 0.404000000059598 | 0 | 0 | 0 |
| 0.404500000059548 | 0 | 0 | 0 |
| 0.405000000059498 | 0 | 0 | 0 |
| 0.405500000059448 | 0 | 0 | 0 |
| 0.406000000059398 | 0 | 0 | 0 |
| 0.406500000059348 | 0 | 0 | 0 |
| 0.407000000059298 | 0 | 0 | 0 |
| 0.407500000059248 | 0 | 0 | 0 |
| 0.408000000059198 | 0 | 0 | 0 |
| 0.408500000059148 | 0 | 0 | 0 |
| 0.409000000059098 | 0 | 0 | 0 |
| 0.409500000059048 | 0 | 0 | 0 |
| 0.410000000058998 | 0 | 0 | 0 |
| 0.410500000058948 | 0 | 0 | 0 |
| 0.411000000058898 | 0 | 0 | 0 |
| 0.411500000058848 | 0 | 0 | 0 |
| 0.412000000058798 | 0 | 0 | 0 |
| 0.412500000058748 | 0 | 0 | 0 |
| 0.413000000058698 | 0 | 0 | 0 |
| 0.413500000058648 | 0 | 0 | 0 |
| 0.414000000058598 | 0 | 0 | 0 |
| 0.414500000058548 | 0 | 0 | 0 |
| 0.415000000058498 | 0 | 0 | 0 |
| 0.415500000058448 | 0 | 0 | 0 |
| 0.416000000058398 | 0 | 0 | 0 |
| 0.416500000058348 | 0 | 0 | 0 |
| 0.417000000058298 | 0 | 0 | 0 |
| 0.417500000058248 | 0 | 0 | 0 |
| 0.418000000058198 | 0 | 0 | 0 |
| 0.418500000058148 | 0 | 0 | 0 |
| 0.419000000058098 | 0 | 0 | 0 |
| 0.419500000058048 | 0 | 0 | 0 |
| 0.420000000057998 | 0 | 0 | 0 |
| 0.420500000057948 | 0 | 0 | 0 |
| 0.421000000057898 | 0 | 0 | 0 |
| 0.421500000057848 | 0 | 0 | 0 |
| 0.422000000057798 | 0 | 0 | 0 |
| 0.422500000057748 | 0 | 0 | 0 |
| 0.423000000057698 | 0 | 0 | 0 |
| 0.423500000057648 | 0 | 0 | 0 |
| 0.424000000057598 | 0 | 0 | 0 |
| 0.424500000057548 | 0 | 0 | 0 |
| 0.425000000057498 | 0 | 0 | 0 |
| 0.425500000057448 | 0 | 0 | 0 |
| 0.426000000057398 | 0 | 0 | 0 |
| 0.426500000057348 | 0 | 0 | 0 |
| 0.427000000057298 | 0 | 0 | 0 |
| 0.427500000057248 | 0 | 0 | 0 |
| 0.428000000057197 | 0 | 0 | 0 |
| 0.428500000057147 | 0 | 0 | 0 |
| 0.429000000057097 | 0 | 0 | 0 |
| 0.429500000057047 | 0 | 0 | 0 |
| 0.430000000056997 | 0 | 0 | 0 |
| 0.430500000056947 | 0 | 0 | 0 |
| 0.431000000056897 | 0 | 0 | 0 |
| 0.431500000056847 | 0 | 0 | 0 |
| 0.432000000056797 | 0 | 0 | 0 |
| 0.432500000056747 | 0 | 0 | 0 |
| 0.433000000056697 | 0 | 0 | 0 |
| 0.433500000056647 | 0 | 0 | 0 |
| 0.434000000056597 | 0 | 0 | 0 |
| 0.434500000056547 | 0 | 0 | 0 |
| 0.435000000056497 | 0 | 0 | 0 |
| 0.435500000056447 | 0 | 0 | 0 |
| 0.436000000056397 | 0 | 0 | 0 |
| 0.436500000056347 | 0 | 0 | 0 |
| 0.437000000056297 | 0 | 0 | 0 |
| 0.437500000056247 | 0 | 0 | 0 |
| 0.438000000056197 | 0 | 0 | 0 |
| 0.438500000056147 | 0 | 0 | 0 |
| 0.439000000056097 | 0 | 0 | 0 |
| 0.439500000056047 | 0 | 0 | 0 |
| 0.440000000055997 | 0 | 0 | 0 |
| 0.440500000055947 | 0 | 0 | 0 |
| 0.441000000055897 | 0 | 0 | 0 |
| 0.441500000055847 | 0 | 0 | 0 |
| 0.442000000055797 | 0 | 0 | 0 |
| 0.442500000055747 | 0 | 0 | 0 |
| 0.443000000055697 | 0 | 0 | 0 |
| 0.443500000055647 | 0 | 0 | 0 |
| 0.444000000055597 | 0 | 0 | 0 |
| 0.444500000055547 | 0 | 0 | 0 |
| 0.445000000055497 | 0 | 0 | 0 |
| 0.445500000055447 | 0 | 0 | 0 |
| 0.446000000055397 | 0 | 0 | 0 |
| 0.446500000055347 | 0 | 0 | 0 |
| 0.447000000055297 | 0 | 0 | 0 |
| 0.447500000055247 | 0 | 0 | 0 |
| 0.448000000055197 | 0 | 0 | 0 |
| 0.448500000055147 | 0 | 0 | 0 |
| 0.449000000055097 | 0 | 0 | 0 |
| 0.449500000055047 | 0 | 0 | 0 |
| 0.450000000054997 | 0 | 0 | 0 |
| 0.450500000054947 | 0 | 0 | 0 |
| 0.451000000054897 | 0 | 0 | 0 |
| 0.451500000054847 | 0 | 0 | 0 |
| 0.452000000054797 | 0 | 0 | 0 |
| 0.452500000054747 | 0 | 0 | 0 |
| 0.453000000054697 | 0 | 0 | 0 |
| 0.453500000054647 | 0 | 0 | 0 |
| 0.454000000054597 | 0 | 0 | 0 |
| 0.454500000054547 | 0 | 0 | 0 |
| 0.455000000054497 | 0 | 0 | 0 |
| 0.455500000054447 | 0 | 0 | 0 |
| 0.456000000054397 | 0 | 0 | 0 |
| 0.456500000054347 | 0 | 0 | 0 |
| 0.457000000054297 | 0 | 0 | 0 |
| 0.457500000054247 | 0 | 0 | 0 |
| 0.458000000054197 | 0 | 0 | 0 |
| 0.458500000054147 | 0 | 0 | 0 |
| 0.459000000054097 | 0 | 0 | 0 |
| 0.459500000054047 | 0 | 0 | 0 |
| 0.460000000053997 | 0 | 0 | 0 |
| 0.460500000053947 | 0 | 0 | 0 |
| 0.461000000053896 | 0 | 0 | 0 |
| 0.461500000053846 | 0 | 0 | 0 |
| 0.462000000053796 | 0 | 0 | 0 |
| 0.462500000053746 | 0 | 0 | 0 |
| 0.463000000053696 | 0 | 0 | 0 |
| 0.463500000053646 | 0 | 0 | 0 |
| 0.464000000053596 | 0 | 0 | 0 |
| 0.464500000053546 | 0 | 0 | 0 |
| 0.465000000053496 | 0 | 0 | 0 |
| 0.465500000053446 | 0 | 0 | 0 |
| 0.466000000053396 | 0 | 0 | 0 |
| 0.466500000053346 | 0 | 0 | 0 |
| 0.467000000053296 | 0 | 0 | 0 |
| 0.467500000053246 | 0 | 0 | 0 |
| 0.468000000053196 | 0 | 0 | 0 |
| 0.468500000053146 | 0 | 0 | 0 |
| 0.469000000053096 | 0 | 0 | 0 |
| 0.469500000053046 | 0 | 0 | 0 |
| 0.470000000052996 | 0 | 0 | 0 |
| 0.470500000052946 | 0 | 0 | 0 |
| 0.471000000052896 | 0 | 0 | 0 |
| 0.471500000052846 | 0 | 0 | 0 |
| 0.472000000052796 | 0 | 0 | 0 |
| 0.472500000052746 | 0 | 0 | 0 |
| 0.473000000052696 | 0 | 0 | 0 |
| 0.473500000052646 | 0 | 0 | 0 |
| 0.474000000052596 | 0 | 0 | 0 |
| 0.474500000052546 | 0 | 0 | 0 |
| 0.475000000052496 | 0 | 0 | 0 |
| 0.475500000052446 | 0 | 0 | 0 |
| 0.476000000052396 | 0 | 0 | 0 |
| 0.476500000052346 | 0 | 0 | 0 |
| 0.477000000052296 | 0 | 0 | 0 |
| 0.477500000052246 | 0 | 0 | 0 |
| 0.478000000052196 | 0 | 0 | 0 |
| 0.478500000052146 | 0 | 0 | 0 |
| 0.479000000052096 | 0 | 0 | 0 |
| 0.479500000052046 | 0 | 0 | 0 |
| 0.480000000051996 | 0 | 0 | 0 |
| 0.480500000051946 | 0 | 0 | 0 |
| 0.481000000051896 | 0 | 0 | 0 |
| 0.481500000051846 | 0 | 0 | 0 |
| 0.482000000051796 | 0 | 0 | 0 |
| 0.482500000051746 | 0 | 0 | 0 |
| 0.483000000051696 | 0 | 0 | 0 |
| 0.483500000051646 | 0 | 0 | 0 |
| 0.484000000051596 | 0 | 0 | 0 |
| 0.484500000051546 | 0 | 0 | 0 |
| 0.485000000051496 | 0 | 0 | 0 |
| 0.485500000051446 | 0 | 0 | 0 |
| 0.486000000051396 | 0 | 0 | 0 |
| 0.486500000051346 | 0 | 0 | 0 |
| 0.487000000051296 | 0 | 0 | 0 |
| 0.487500000051246 | 0 | 0 | 0 |
| 0.488000000051196 | 0 | 0 | 0 |
| 0.488500000051146 | 0 | 0 | 0 |
| 0.489000000051096 | 0 | 0 | 0 |
| 0.489500000051046 | 0 | 0 | 0 |
| 0.490000000050996 | 0 | 0 | 0 |
| 0.490500000050946 | 0 | 0 | 0 |
| 0.491000000050896 | 0 | 0 | 0 |
| 0.491500000050846 | 0 | 0 | 0 |
| 0.492000000050796 | 0 | 0 | 0 |
| 0.492500000050746 | 0 | 0 | 0 |
| 0.493000000050696 | 0 | 0 | 0 |
| 0.493500000050645 | 0 | 0 | 0 |
| 0.494000000050595 | 0 | 0 | 0 |
| 0.494500000050545 | 0 | 0 | 0 |
| 0.495000000050495 | 0 | 0 | 0 |
| 0.495500000050445 | 0 | 0 | 0 |
| 0.496000000050395 | 0 | 0 | 0 |
| 0.496500000050345 | 0 | 0 | 0 |
| 0.497000000050295 | 0 | 0 | 0 |
| 0.497500000050245 | 0 | 0 | 0 |
| 0.498000000050195 | 0 | 0 | 0 |
| 0.498500000050145 | 0 | 0 | 0 |
| 0.499000000050095 | 0 | 0 | 0 |
| 0.499500000050045 | 0 | 0 | 0 |
| 0.500000000049995 | 0 | 0 | 0 |
| 0.500500000049945 | 0 | 0 | 0 |
| 0.501000000049895 | 0 | 0 | 0 |
| 0.501500000049845 | 0 | 0 | 0 |
| 0.502000000049795 | 0 | 0 | 0 |
| 0.502500000049745 | 0 | 0 | 0 |
| 0.503000000049695 | 0 | 0 | 0 |
| 0.503500000049645 | 0 | 0 | 0 |
| 0.504000000049595 | 0 | 0 | 0 |
| 0.504500000049545 | 0 | 0 | 0 |
| 0.505000000049495 | 0 | 0 | 0 |
| 0.505500000049445 | 0 | 0 | 0 |
| 0.506000000049395 | 0 | 0 | 0 |
| 0.506500000049345 | 0 | 0 | 0 |
| 0.507000000049295 | 0 | 0 | 0 |
| 0.507500000049245 | 0 | 0 | 0 |
| 0.508000000049195 | 0 | 0 | 0 |
| 0.508500000049145 | 0 | 0 | 0 |
| 0.509000000049095 | 0 | 0 | 0 |
| 0.509500000049045 | 0 | 0 | 0 |
| 0.510000000048995 | 0 | 0 | 0 |
| 0.510500000048945 | 0 | 0 | 0 |
| 0.511000000048895 | 0 | 0 | 0 |
| 0.511500000048845 | 0 | 0 | 0 |
| 0.512000000048795 | 0 | 0 | 0 |
| 0.512500000048745 | 0 | 0 | 0 |
| 0.513000000048695 | 0 | 0 | 0 |
| 0.513500000048645 | 0 | 0 | 0 |
| 0.514000000048595 | 0 | 0 | 0 |
| 0.514500000048545 | 0 | 0 | 0 |
| 0.515000000048495 | 0 | 0 | 0 |
| 0.515500000048445 | 0 | 0 | 0 |
| 0.516000000048395 | 0 | 0 | 0 |
| 0.516500000048345 | 0 | 0 | 0 |
| 0.517000000048295 | 0 | 0 | 0 |
| 0.517500000048245 | 0 | 0 | 0 |
| 0.518000000048195 | 0 | 0 | 0 |
| 0.518500000048145 | 0 | 0 | 0 |
| 0.519000000048095 | 0 | 0 | 0 |
| 0.519500000048045 | 0 | 0 | 0 |
| 0.520000000047995 | 0 | 0 | 0 |
| 0.520500000047945 | 0 | 0 | 0 |
| 0.521000000047895 | 0 | 0 | 0 |
| 0.521500000047845 | 0 | 0 | 0 |
| 0.522000000047795 | 0 | 0 | 0 |
| 0.522500000047745 | 0 | 0 | 0 |
| 0.523000000047695 | 0 | 0 | 0 |
| 0.523500000047645 | 0 | 0 | 0 |
| 0.524000000047595 | 0 | 0 | 0 |
| 0.524500000047545 | 0 | 0 | 0 |
| 0.525000000047495 | 0 | 0 | 0 |
| 0.525500000047445 | 0 | 0 | 0 |
| 0.526000000047395 | 0 | 0 | 0 |
| 0.526500000047345 | 0 | 0 | 0 |
| 0.527000000047295 | 0 | 0 | 0 |
| 0.527500000047245 | 0 | 0 | 0 |
| 0.528000000047194 | 0 | 0 | 0 |
| 0.528500000047144 | 0 | 0 | 0 |
| 0.529000000047094 | 0 | 0 | 0 |
| 0.529500000047044 | 0 | 0 | 0 |
| 0.530000000046994 | 0 | 0 | 0 |
| 0.530500000046944 | 0 | 0 | 0 |
| 0.531000000046894 | 0 | 0 | 0 |
| 0.531500000046844 | 0 | 0 | 0 |
| 0.532000000046794 | 0 | 0 | 0 |
| 0.532500000046744 | 0 | 0 | 0 |
| 0.533000000046694 | 0 | 0 | 0 |
| 0.533500000046644 | 0 | 0 | 0 |
| 0.534000000046594 | 0 | 0 | 0 |
| 0.534500000046544 | 0 | 0 | 0 |
| 0.535000000046494 | 0 | 0 | 0 |
| 0.535500000046444 | 0 | 0 | 0 |
| 0.536000000046394 | 0 | 0 | 0 |
| 0.536500000046344 | 0 | 0 | 0 |
| 0.537000000046294 | 0 | 0 | 0 |
| 0.537500000046244 | 0 | 0 | 0 |
| 0.538000000046194 | 0 | 0 | 0 |
| 0.538500000046144 | 0 | 0 | 0 |
| 0.539000000046094 | 0 | 0 | 0 |
| 0.539500000046044 | 0 | 0 | 0 |
| 0.540000000045994 | 0 | 0 | 0 |
| 0.540500000045944 | 0 | 0 | 0 |
| 0.541000000045894 | 0 | 0 | 0 |
| 0.541500000045844 | 0 | 0 | 0 |
| 0.542000000045794 | 0 | 0 | 0 |
| 0.542500000045744 | 0 | 0 | 0 |
| 0.543000000045694 | 0 | 0 | 0 |
| 0.543500000045644 | 0 | 0 | 0 |
| 0.544000000045594 | 0 | 0 | 0 |
| 0.544500000045544 | 0 | 0 | 0 |
| 0.545000000045494 | 0 | 0 | 0 |
| 0.545500000045444 | 0 | 0 | 0 |
| 0.546000000045394 | 0 | 0 | 0 |
| 0.546500000045344 | 0 | 0 | 0 |
| 0.547000000045294 | 0 | 0 | 0 |
| 0.547500000045244 | 0 | 0 | 0 |
| 0.548000000045194 | 0 | 0 | 0 |
| 0.548500000045144 | 0 | 0 | 0 |
| 0.549000000045094 | 0 | 0 | 0 |
| 0.549500000045044 | 0 | 0 | 0 |
| 0.550000000044994 | 0 | 0 | 0 |
| 0.550500000044944 | 0 | 0 | 0 |
| 0.551000000044894 | 0 | 0 | 0 |
| 0.551500000044844 | 0 | 0 | 0 |
| 0.552000000044794 | 0 | 0 | 0 |
| 0.552500000044744 | 0 | 0 | 0 |
| 0.553000000044694 | 0 | 0 | 0 |
| 0.553500000044644 | 0 | 0 | 0 |
| 0.554000000044594 | 0 | 0 | 0 |
| 0.554500000044544 | 0 | 0 | 0 |
| 0.555000000044494 | 0 | 0 | 0 |
| 0.555500000044444 | 0 | 0 | 0 |
| 0.556000000044394 | 0 | 0 | 0 |
| 0.556500000044344 | 0 | 0 | 0 |
| 0.557000000044294 | 0 | 0 | 0 |
| 0.557500000044244 | 0 | 0 | 0 |
| 0.558000000044194 | 0 | 0 | 0 |
| 0.558500000044144 | 0 | 0 | 0 |
| 0.559000000044094 | 0 | 0 | 0 |
| 0.559500000044044 | 0 | 0 | 0 |
| 0.560000000043994 | 0 | 0 | 0 |
| 0.560500000043944 | 0 | 0 | 0 |
| 0.561000000043893 | 0 | 0 | 0 |
| 0.561500000043843 | 0 | 0 | 0 |
| 0.562000000043793 | 0 | 0 | 0 |
| 0.562500000043743 | 0 | 0 | 0 |
| 0.563000000043693 | 0 | 0 | 0 |
| 0.563500000043643 | 0 | 0 | 0 |
| 0.564000000043593 | 0 | 0 | 0 |
| 0.564500000043543 | 0 | 0 | 0 |
| 0.565000000043493 | 0 | 0 | 0 |
| 0.565500000043443 | 0 | 0 | 0 |
| 0.566000000043393 | 0 | 0 | 0 |
| 0.566500000043343 | 0 | 0 | 0 |
| 0.567000000043293 | 0 | 0 | 0 |
| 0.567500000043243 | 0 | 0 | 0 |
| 0.568000000043193 | 0 | 0 | 0 |
| 0.568500000043143 | 0 | 0 | 0 |
| 0.569000000043093 | 0 | 0 | 0 |
| 0.569500000043043 | 0 | 0 | 0 |
| 0.570000000042993 | 0 | 0 | 0 |
| 0.570500000042943 | 0 | 0 | 0 |
| 0.571000000042893 | 0 | 0 | 0 |
| 0.571500000042843 | 0 | 0 | 0 |
| 0.572000000042793 | 0 | 0 | 0 |
| 0.572500000042743 | 0 | 0 | 0 |
| 0.573000000042693 | 0 | 0 | 0 |
| 0.573500000042643 | 0 | 0 | 0 |
| 0.574000000042593 | 0 | 0 | 0 |
| 0.574500000042543 | 0 | 0 | 0 |
| 0.575000000042493 | 0 | 0 | 0 |
| 0.575500000042443 | 0 | 0 | 0 |
| 0.576000000042393 | 0 | 0 | 0 |
| 0.576500000042343 | 0 | 0 | 0 |
| 0.577000000042293 | 0 | 0 | 0 |
| 0.577500000042243 | 0 | 0 | 0 |
| 0.578000000042193 | 0 | 0 | 0 |
| 0.578500000042143 | 0 | 0 | 0 |
| 0.579000000042093 | 0 | 0 | 0 |
| 0.579500000042043 | 0 | 0 | 0 |
| 0.580000000041993 | 0 | 0 | 0 |
| 0.580500000041943 | 0 | 0 | 0 |
| 0.581000000041893 | 0 | 0 | 0 |
| 0.581500000041843 | 0 | 0 | 0 |
| 0.582000000041793 | 0 | 0 | 0 |
| 0.582500000041743 | 0 | 0 | 0 |
| 0.583000000041693 | 0 | 0 | 0 |
| 0.583500000041643 | 0 | 0 | 0 |
| 0.584000000041593 | 0 | 0 | 0 |
| 0.584500000041543 | 0 | 0 | 0 |
| 0.585000000041493 | 0 | 0 | 0 |
| 0.585500000041443 | 0 | 0 | 0 |
| 0.586000000041393 | 0 | 0 | 0 |
| 0.586500000041343 | 0 | 0 | 0 |
| 0.587000000041293 | 0 | 0 | 0 |
| 0.587500000041243 | 0 | 0 | 0 |
| 0.588000000041193 | 0 | 0 | 0 |
| 0.588500000041143 | 0 | 0 | 0 |
| 0.589000000041093 | 0 | 0 | 0 |
| 0.589500000041043 | 0 | 0 | 0 |
| 0.590000000040993 | 0 | 0 | 0 |
| 0.590500000040943 | 0 | 0 | 0 |
| 0.591000000040893 | 0 | 0 | 0 |
| 0.591500000040843 | 0 | 0 | 0 |
| 0.592000000040793 | 0 | 0 | 0 |
| 0.592500000040743 | 0 | 0 | 0 |
| 0.593000000040693 | 0 | 0 | 0 |
| 0.593500000040642 | 0 | 0 | 0 |
| 0.594000000040592 | 0 | 0 | 0 |
| 0.594500000040542 | 0 | 0 | 0 |
| 0.595000000040492 | 0 | 0 | 0 |
| 0.595500000040442 | 0 | 0 | 0 |
| 0.596000000040392 | 0 | 0 | 0 |
| 0.596500000040342 | 0 | 0 | 0 |
| 0.597000000040292 | 0 | 0 | 0 |
| 0.597500000040242 | 0 | 0 | 0 |
| 0.598000000040192 | 0 | 0 | 0 |
| 0.598500000040142 | 0 | 0 | 0 |
| 0.599000000040092 | 0 | 0 | 0 |
| 0.599500000040042 | 0 | 0 | 0 |
| 0.600000000039992 | 0 | 0 | 0 |
| 0.600500000039942 | 0 | 0 | 0 |
| 0.601000000039892 | 0 | 0 | 0 |
| 0.601500000039842 | 0 | 0 | 0 |
| 0.602000000039792 | 0 | 0 | 0 |
| 0.602500000039742 | 0 | 0 | 0 |
| 0.603000000039692 | 0 | 0 | 0 |
| 0.603500000039642 | 0 | 0 | 0 |
| 0.604000000039592 | 0 | 0 | 0 |
| 0.604500000039542 | 0 | 0 | 0 |
| 0.605000000039492 | 0 | 0 | 0 |
| 0.605500000039442 | 0 | 0 | 0 |
| 0.606000000039392 | 0 | 0 | 0 |
| 0.606500000039342 | 0 | 0 | 0 |
| 0.607000000039292 | 0 | 0 | 0 |
| 0.607500000039242 | 0 | 0 | 0 |
| 0.608000000039192 | 0 | 0 | 0 |
| 0.608500000039142 | 0 | 0 | 0 |
| 0.609000000039092 | 0 | 0 | 0 |
| 0.609500000039042 | 0 | 0 | 0 |
| 0.610000000038992 | 0 | 0 | 0 |
| 0.610500000038942 | 0 | 0 | 0 |
| 0.611000000038892 | 0 | 0 | 0 |
| 0.611500000038842 | 0 | 0 | 0 |
| 0.612000000038792 | 0 | 0 | 0 |
| 0.612500000038742 | 0 | 0 | 0 |
| 0.613000000038692 | 0 | 0 | 0 |
| 0.613500000038642 | 0 | 0 | 0 |
| 0.614000000038592 | 0 | 0 | 0 |
| 0.614500000038542 | 0 | 0 | 0 |
| 0.615000000038492 | 0 | 0 | 0 |
| 0.615500000038442 | 0 | 0 | 0 |
| 0.616000000038392 | 0 | 0 | 0 |
| 0.616500000038342 | 0 | 0 | 0 |
| 0.617000000038292 | 0 | 0 | 0 |
| 0.617500000038242 | 0 | 0 | 0 |
| 0.618000000038192 | 0 | 0 | 0 |
| 0.618500000038142 | 0 | 0 | 0 |
| 0.619000000038092 | 0 | 0 | 0 |
| 0.619500000038042 | 0 | 0 | 0 |
| 0.620000000037992 | 0 | 0 | 0 |
| 0.620500000037942 | 0 | 0 | 0 |
| 0.621000000037892 | 0 | 0 | 0 |
| 0.621500000037842 | 0 | 0 | 0 |
| 0.622000000037792 | 0 | 0 | 0 |
| 0.622500000037742 | 0 | 0 | 0 |
| 0.623000000037692 | 0 | 0 | 0 |
| 0.623500000037642 | 0 | 0 | 0 |
| 0.624000000037592 | 0 | 0 | 0 |
| 0.624500000037541 | 0 | 0 | 0 |
| 0.625000000037491 | 0 | 0 | 0 |
| 0.625500000037441 | 0 | 0 | 0 |
| 0.626000000037391 | 0 | 0 | 0 |
| 0.626500000037341 | 0 | 0 | 0 |
| 0.627000000037291 | 0 | 0 | 0 |
| 0.627500000037241 | 0 | 0 | 0 |
| 0.628000000037191 | 0 | 0 | 0 |
| 0.628500000037141 | 0 | 0 | 0 |
| 0.629000000037091 | 0 | 0 | 0 |
| 0.629500000037041 | 0 | 0 | 0 |
| 0.630000000036991 | 0 | 0 | 0 |
| 0.630500000036941 | 0 | 0 | 0 |
| 0.631000000036891 | 0 | 0 | 0 |
| 0.631500000036841 | 0 | 0 | 0 |
| 0.632000000036791 | 0 | 0 | 0 |
| 0.632500000036741 | 0 | 0 | 0 |
| 0.633000000036691 | 0 | 0 | 0 |
| 0.633500000036641 | 0 | 0 | 0 |
| 0.634000000036591 | 0 | 0 | 0 |
| 0.634500000036541 | 0 | 0 | 0 |
| 0.635000000036491 | 0 | 0 | 0 |
| 0.635500000036441 | 0 | 0 | 0 |
| 0.636000000036391 | 0 | 0 | 0 |
| 0.636500000036341 | 0 | 0 | 0 |
| 0.637000000036291 | 0 | 0 | 0 |
| 0.637500000036241 | 0 | 0 | 0 |
| 0.638000000036191 | 0 | 0 | 0 |
| 0.638500000036141 | 0 | 0 | 0 |
| 0.639000000036091 | 0 | 0 | 0 |
| 0.639500000036041 | 0 | 0 | 0 |
| 0.640000000035991 | 0 | 0 | 0 |
| 0.640500000035941 | 0 | 0 | 0 |
| 0.641000000035891 | 0 | 0 | 0 |
| 0.641500000035841 | 0 | 0 | 0 |
| 0.642000000035791 | 0 | 0 | 0 |
| 0.642500000035741 | 0 | 0 | 0 |
| 0.643000000035691 | 0 | 0 | 0 |
| 0.643500000035641 | 0 | 0 | 0 |
| 0.644000000035591 | 0 | 0 | 0 |
| 0.644500000035541 | 0 | 0 | 0 |
| 0.645000000035491 | 0 | 0 | 0 |
| 0.645500000035441 | 0 | 0 | 0 |
| 0.646000000035391 | 0 | 0 | 0 |
| 0.646500000035341 | 0 | 0 | 0 |
| 0.647000000035291 | 0 | 0 | 0 |
| 0.647500000035241 | 0 | 0 | 0 |
| 0.648000000035191 | 0 | 0 | 0 |
| 0.648500000035141 | 0 | 0 | 0 |
| 0.649000000035091 | 0 | 0 | 0 |
| 0.649500000035041 | 0 | 0 | 0 |
| 0.650000000034991 | 0 | 0 | 0 |
| 0.650500000034941 | 0 | 0 | 0 |
| 0.651000000034891 | 0 | 0 | 0 |
| 0.651500000034841 | 0 | 0 | 0 |
| 0.652000000034791 | 0 | 0 | 0 |
| 0.652500000034741 | 0 | 0 | 0 |
| 0.653000000034691 | 0 | 0 | 0 |
| 0.653500000034641 | 0 | 0 | 0 |
| 0.654000000034591 | 0 | 0 | 0 |
| 0.654500000034541 | 0 | 0 | 0 |
| 0.655000000034491 | 0 | 0 | 0 |
| 0.655500000034441 | 0 | 0 | 0 |
| 0.656000000034391 | 0 | 0 | 0 |
| 0.656500000034341 | 0 | 0 | 0 |
| 0.65700000003429 | 0 | 0 | 0 |
| 0.65750000003424 | 0 | 0 | 0 |
| 0.65800000003419 | 0 | 0 | 0 |
| 0.65850000003414 | 0 | 0 | 0 |
| 0.65900000003409 | 0 | 0 | 0 |
| 0.65950000003404 | 0 | 0 | 0 |
| 0.66000000003399 | 0 | 0 | 0 |
| 0.66050000003394 | 0 | 0 | 0 |
| 0.66100000003389 | 0 | 0 | 0 |
| 0.66150000003384 | 0 | 0 | 0 |
| 0.66200000003379 | 0 | 0 | 0 |
| 0.66250000003374 | 0 | 0 | 0 |
| 0.66300000003369 | 0 | 0 | 0 |
| 0.66350000003364 | 0 | 0 | 0 |
| 0.66400000003359 | 0 | 0 | 0 |
| 0.66450000003354 | 0 | 0 | 0 |
| 0.66500000003349 | 0 | 0 | 0 |
| 0.66550000003344 | 0 | 0 | 0 |
| 0.66600000003339 | 0 | 0 | 0 |
| 0.66650000003334 | 0 | 0 | 0 |
| 0.66700000003329 | 0 | 0 | 0 |
| 0.66750000003324 | 0 | 0 | 0 |
| 0.66800000003319 | 0 | 0 | 0 |
| 0.66850000003314 | 0 | 0 | 0 |
| 0.66900000003309 | 0 | 0 | 0 |
| 0.66950000003304 | 0 | 0 | 0 |
| 0.67000000003299 | 0 | 0 | 0 |
| 0.67050000003294 | 0 | 0 | 0 |
| 0.67100000003289 | 0 | 0 | 0 |
| 0.67150000003284 | 0 | 0 | 0 |
| 0.67200000003279 | 0 | 0 | 0 |
| 0.67250000003274 | 0 | 0 | 0 |
| 0.67300000003269 | 0 | 0 | 0 |
| 0.67350000003264 | 0 | 0 | 0 |
| 0.67400000003259 | 0 | 0 | 0 |
| 0.67450000003254 | 0 | 0 | 0 |
| 0.67500000003249 | 0 | 0 | 0 |
| 0.67550000003244 | 0 | 0 | 0 |
| 0.67600000003239 | 0 | 0 | 0 |
| 0.67650000003234 | 0 | 0 | 0 |
| 0.67700000003229 | 0 | 0 | 0 |
| 0.67750000003224 | 0 | 0 | 0 |
| 0.67800000003219 | 0 | 0 | 0 |
| 0.67850000003214 | 0 | 0 | 0 |
| 0.67900000003209 | 0 | 0 | 0 |
| 0.67950000003204 | 0 | 0 | 0 |
| 0.68000000003199 | 0 | 0 | 0 |
| 0.68050000003194 | 0 | 0 | 0 |
| 0.68100000003189 | 0 | 0 | 0 |
| 0.68150000003184 | 0 | 0 | 0 |
| 0.68200000003179 | 0 | 0 | 0 |
| 0.68250000003174 | 0 | 0 | 0 |
| 0.68300000003169 | 0 | 0 | 0 |
| 0.68350000003164 | 0 | 0 | 0 |
| 0.68400000003159 | 0 | 0 | 0 |
| 0.68450000003154 | 0 | 0 | 0 |
| 0.68500000003149 | 0 | 0 | 0 |
| 0.68550000003144 | 0 | 0 | 0 |
| 0.68600000003139 | 0 | 0 | 0 |
| 0.68650000003134 | 0 | 0 | 0 |
| 0.68700000003129 | 0 | 0 | 0 |
| 0.68750000003124 | 0 | 0 | 0 |
| 0.68800000003119 | 0 | 0 | 0 |
| 0.68850000003114 | 0 | 0 | 0 |
| 0.68900000003109 | 0 | 0 | 0 |
| 0.68950000003104 | 0 | 0 | 0 |
| 0.690000000030989 | 0 | 0 | 0 |
| 0.690500000030939 | 0 | 0 | 0 |
| 0.691000000030889 | 0 | 0 | 0 |
| 0.691500000030839 | 0 | 0 | 0 |
| 0.692000000030789 | 0 | 0 | 0 |
| 0.692500000030739 | 0 | 0 | 0 |
| 0.693000000030689 | 0 | 0 | 0 |
| 0.693500000030639 | 0 | 0 | 0 |
| 0.694000000030589 | 0 | 0 | 0 |
| 0.694500000030539 | 0 | 0 | 0 |
| 0.695000000030489 | 0 | 0 | 0 |
| 0.695500000030439 | 0 | 0 | 0 |
| 0.696000000030389 | 0 | 0 | 0 |
| 0.696500000030339 | 0 | 0 | 0 |
| 0.697000000030289 | 0 | 0 | 0 |
| 0.697500000030239 | 0 | 0 | 0 |
| 0.698000000030189 | 0 | 0 | 0 |
| 0.698500000030139 | 0 | 0 | 0 |
| 0.699000000030089 | 0 | 0 | 0 |
| 0.699500000030039 | 0 | 0 | 0 |
| 0.700000000029989 | 0 | 0 | 0 |
| 0.700500000029939 | 0 | 0 | 0 |
| 0.701000000029889 | 0 | 0 | 0 |
| 0.701500000029839 | 0 | 0 | 0 |
| 0.702000000029789 | 0 | 0 | 0 |
| 0.702500000029739 | 0 | 0 | 0 |
| 0.703000000029689 | 0 | 0 | 0 |
| 0.703500000029639 | 0 | 0 | 0 |
| 0.704000000029589 | 0 | 0 | 0 |
| 0.704500000029539 | 0 | 0 | 0 |
| 0.705000000029489 | 0 | 0 | 0 |
| 0.705500000029439 | 0 | 0 | 0 |
| 0.706000000029389 | 0 | 0 | 0 |
| 0.706500000029339 | 0 | 0 | 0 |
| 0.707000000029289 | 0 | 0 | 0 |
| 0.707500000029239 | 0 | 0 | 0 |
| 0.708000000029189 | 0 | 0 | 0 |
| 0.708500000029139 | 0 | 0 | 0 |
| 0.709000000029089 | 0 | 0 | 0 |
| 0.709500000029039 | 0 | 0 | 0 |
| 0.710000000028989 | 0 | 0 | 0 |
| 0.710500000028939 | 0 | 0 | 0 |
| 0.711000000028889 | 0 | 0 | 0 |
| 0.711500000028839 | 0 | 0 | 0 |
| 0.712000000028789 | 0 | 0 | 0 |
| 0.712500000028739 | 0 | 0 | 0 |
| 0.713000000028689 | 0 | 0 | 0 |
| 0.713500000028639 | 0 | 0 | 0 |
| 0.714000000028589 | 0 | 0 | 0 |
| 0.714500000028539 | 0 | 0 | 0 |
| 0.715000000028489 | 0 | 0 | 0 |
| 0.715500000028439 | 0 | 0 | 0 |
| 0.716000000028389 | 0 | 0 | 0 |
| 0.716500000028339 | 0 | 0 | 0 |
| 0.717000000028289 | 0 | 0 | 0 |
| 0.717500000028239 | 0 | 0 | 0 |
| 0.718000000028189 | 0 | 0 | 0 |
| 0.718500000028139 | 0 | 0 | 0 |
| 0.719000000028089 | 0 | 0 | 0 |
| 0.719500000028039 | 0 | 0 | 0 |
| 0.720000000027989 | 0 | 0 | 0 |
| 0.720500000027939 | 0 | 0 | 0 |
| 0.721000000027889 | 0 | 0 | 0 |
| 0.721500000027839 | 0 | 0 | 0 |
| 0.722000000027789 | 0 | 0 | 0 |
| 0.722500000027739 | 0 | 0 | 0 |
| 0.723000000027689 | 0 | 0 | 0 |
| 0.723500000027639 | 0 | 0 | 0 |
| 0.724000000027589 | 0 | 0 | 0 |
| 0.724500000027538 | 0 | 0 | 0 |
| 0.725000000027488 | 0 | 0 | 0 |
| 0.725500000027438 | 0 | 0 | 0 |
| 0.726000000027388 | 0 | 0 | 0 |
| 0.726500000027338 | 0 | 0 | 0 |
| 0.727000000027288 | 0 | 0 | 0 |
| 0.727500000027238 | 0 | 0 | 0 |
| 0.728000000027188 | 0 | 0 | 0 |
| 0.728500000027138 | 0 | 0 | 0 |
| 0.729000000027088 | 0 | 0 | 0 |
| 0.729500000027038 | 0 | 0 | 0 |
| 0.730000000026988 | 0 | 0 | 0 |
| 0.730500000026938 | 0 | 0 | 0 |
| 0.731000000026888 | 0 | 0 | 0 |
| 0.731500000026838 | 0 | 0 | 0 |
| 0.732000000026788 | 0 | 0 | 0 |
| 0.732500000026738 | 0 | 0 | 0 |
| 0.733000000026688 | 0 | 0 | 0 |
| 0.733500000026638 | 0 | 0 | 0 |
| 0.734000000026588 | 0 | 0 | 0 |
| 0.734500000026538 | 0 | 0 | 0 |
| 0.735000000026488 | 0 | 0 | 0 |
| 0.735500000026438 | 0 | 0 | 0 |
| 0.736000000026388 | 0 | 0 | 0 |
| 0.736500000026338 | 0 | 0 | 0 |
| 0.737000000026288 | 0 | 0 | 0 |
| 0.737500000026238 | 0 | 0 | 0 |
| 0.738000000026188 | 0 | 0 | 0 |
| 0.738500000026138 | 0 | 0 | 0 |
| 0.739000000026088 | 0 | 0 | 0 |
| 0.739500000026038 | 0 | 0 | 0 |
| 0.740000000025988 | 0 | 0 | 0 |
| 0.740500000025938 | 0 | 0 | 0 |
| 0.741000000025888 | 0 | 0 | 0 |
| 0.741500000025838 | 0 | 0 | 0 |
| 0.742000000025788 | 0 | 0 | 0 |
| 0.742500000025738 | 0 | 0 | 0 |
| 0.743000000025688 | 0 | 0 | 0 |
| 0.743500000025638 | 0 | 0 | 0 |
| 0.744000000025588 | 0 | 0 | 0 |
| 0.744500000025538 | 0 | 0 | 0 |
| 0.745000000025488 | 0 | 0 | 0 |
| 0.745500000025438 | 0 | 0 | 0 |
| 0.746000000025388 | 0 | 0 | 0 |
| 0.746500000025338 | 0 | 0 | 0 |
| 0.747000000025288 | 0 | 0 | 0 |
| 0.747500000025238 | 0 | 0 | 0 |
| 0.748000000025188 | 0 | 0 | 0 |
| 0.748500000025138 | 0 | 0 | 0 |
| 0.749000000025088 | 0 | 0 | 0 |
| 0.749500000025038 | 0 | 0 | 0 |
| 0.750000000024988 | 0 | 0 | 0 |
| 0.750500000024938 | 0 | 0 | 0 |
| 0.751000000024888 | 0 | 0 | 0 |
| 0.751500000024838 | 0 | 0 | 0 |
| 0.752000000024788 | 0 | 0 | 0 |
| 0.752500000024738 | 0 | 0 | 0 |
| 0.753000000024688 | 0 | 0 | 0 |
| 0.753500000024638 | 0 | 0 | 0 |
| 0.754000000024588 | 0 | 0 | 0 |
| 0.754500000024538 | 0 | 0 | 0 |
| 0.755000000024488 | 0 | 0 | 0 |
| 0.755500000024438 | 0 | 0 | 0 |
| 0.756000000024388 | 0 | 0 | 0 |
| 0.756500000024338 | 0 | 0 | 0 |
| 0.757000000024287 | 0 | 0 | 0 |
| 0.757500000024237 | 0 | 0 | 0 |
| 0.758000000024187 | 0 | 0 | 0 |
| 0.758500000024137 | 0 | 0 | 0 |
| 0.759000000024087 | 0 | 0 | 0 |
| 0.759500000024037 | 0 | 0 | 0 |
| 0.760000000023987 | 0 | 0 | 0 |
| 0.760500000023937 | 0 | 0 | 0 |
| 0.761000000023887 | 0 | 0 | 0 |
| 0.761500000023837 | 0 | 0 | 0 |
| 0.762000000023787 | 0 | 0 | 0 |
| 0.762500000023737 | 0 | 0 | 0 |
| 0.763000000023687 | 0 | 0 | 0 |
| 0.763500000023637 | 0 | 0 | 0 |
| 0.764000000023587 | 0 | 0 | 0 |
| 0.764500000023537 | 0 | 0 | 0 |
| 0.765000000023487 | 0 | 0 | 0 |
| 0.765500000023437 | 0 | 0 | 0 |
| 0.766000000023387 | 0 | 0 | 0 |
| 0.766500000023337 | 0 | 0 | 0 |
| 0.767000000023287 | 0 | 0 | 0 |
| 0.767500000023237 | 0 | 0 | 0 |
| 0.768000000023187 | 0 | 0 | 0 |
| 0.768500000023137 | 0 | 0 | 0 |
| 0.769000000023087 | 0 | 0 | 0 |
| 0.769500000023037 | 0 | 0 | 0 |
| 0.770000000022987 | 0 | 0 | 0 |
| 0.770500000022937 | 0 | 0 | 0 |
| 0.771000000022887 | 0 | 0 | 0 |
| 0.771500000022837 | 0 | 0 | 0 |
| 0.772000000022787 | 0 | 0 | 0 |
| 0.772500000022737 | 0 | 0 | 0 |
| 0.773000000022687 | 0 | 0 | 0 |
| 0.773500000022637 | 0 | 0 | 0 |
| 0.774000000022587 | 0 | 0 | 0 |
| 0.774500000022537 | 0 | 0 | 0 |
| 0.775000000022487 | 0 | 0 | 0 |
| 0.775500000022437 | 0 | 0 | 0 |
| 0.776000000022387 | 0 | 0 | 0 |
| 0.776500000022337 | 0 | 0 | 0 |
| 0.777000000022287 | 0 | 0 | 0 |
| 0.777500000022237 | 0 | 0 | 0 |
| 0.778000000022187 | 0 | 0 | 0 |
| 0.778500000022137 | 0 | 0 | 0 |
| 0.779000000022087 | 0 | 0 | 0 |
| 0.779500000022037 | 0 | 0 | 0 |
| 0.780000000021987 | 0 | 0 | 0 |
| 0.780500000021937 | 0 | 0 | 0 |
| 0.781000000021887 | 0 | 0 | 0 |
| 0.781500000021837 | 0 | 0 | 0 |
| 0.782000000021787 | 0 | 0 | 0 |
| 0.782500000021737 | 0 | 0 | 0 |
| 0.783000000021687 | 0 | 0 | 0 |
| 0.783500000021637 | 0 | 0 | 0 |
| 0.784000000021587 | 0 | 0 | 0 |
| 0.784500000021537 | 0 | 0 | 0 |
| 0.785000000021487 | 0 | 0 | 0 |
| 0.785500000021437 | 0 | 0 | 0 |
| 0.786000000021387 | 0 | 0 | 0 |
| 0.786500000021337 | 0 | 0 | 0 |
| 0.787000000021287 | 0 | 0 | 0 |
| 0.787500000021237 | 0 | 0 | 0 |
| 0.788000000021187 | 0 | 0 | 0 |
| 0.788500000021137 | 0 | 0 | 0 |
| 0.789000000021087 | 0 | 0 | 0 |
| 0.789500000021037 | 0 | 0 | 0 |
| 0.790000000020986 | 0 | 0 | 0 |
| 0.790500000020936 | 0 | 0 | 0 |
| 0.791000000020886 | 0 | 0 | 0 |
| 0.791500000020836 | 0 | 0 | 0 |
| 0.792000000020786 | 0 | 0 | 0 |
| 0.792500000020736 | 0 | 0 | 0 |
| 0.793000000020686 | 0 | 0 | 0 |
| 0.793500000020636 | 0 | 0 | 0 |
| 0.794000000020586 | 0 | 0 | 0 |
| 0.794500000020536 | 0 | 0 | 0 |
| 0.795000000020486 | 0 | 0 | 0 |
| 0.795500000020436 | 0 | 0 | 0 |
| 0.796000000020386 | 0 | 0 | 0 |
| 0.796500000020336 | 0 | 0 | 0 |
| 0.797000000020286 | 0 | 0 | 0 |
| 0.797500000020236 | 0 | 0 | 0 |
| 0.798000000020186 | 0 | 0 | 0 |
| 0.798500000020136 | 0 | 0 | 0 |
| 0.799000000020086 | 0 | 0 | 0 |
| 0.799500000020036 | 0 | 0 | 0 |
| 0.800000000019986 | 0 | 0 | 0 |
| 0.800500000019936 | 0 | 0 | 0 |
| 0.801000000019886 | 0 | 0 | 0 |
| 0.801500000019836 | 0 | 0 | 0 |
| 0.802000000019786 | 0 | 0 | 0 |
| 0.802500000019736 | 0 | 0 | 0 |
| 0.803000000019686 | 0 | 0 | 0 |
| 0.803500000019636 | 0 | 0 | 0 |
| 0.804000000019586 | 0 | 0 | 0 |
| 0.804500000019536 | 0 | 0 | 0 |
| 0.805000000019486 | 0 | 0 | 0 |
| 0.805500000019436 | 0 | 0 | 0 |
| 0.806000000019386 | 0 | 0 | 0 |
| 0.806500000019336 | 0 | 0 | 0 |
| 0.807000000019286 | 0 | 0 | 0 |
| 0.807500000019236 | 0 | 0 | 0 |
| 0.808000000019186 | 0 | 0 | 0 |
| 0.808500000019136 | 0 | 0 | 0 |
| 0.809000000019086 | 0 | 0 | 0 |
| 0.809500000019036 | 0 | 0 | 0 |
| 0.810000000018986 | 0 | 0 | 0 |
| 0.810500000018936 | 0 | 0 | 0 |
| 0.811000000018886 | 0 | 0 | 0 |
| 0.811500000018836 | 0 | 0 | 0 |
| 0.812000000018786 | 0 | 0 | 0 |
| 0.812500000018736 | 0 | 0 | 0 |
| 0.813000000018686 | 0 | 0 | 0 |
| 0.813500000018636 | 0 | 0 | 0 |
| 0.814000000018586 | 0 | 0 | 0 |
| 0.814500000018536 | 0 | 0 | 0 |
| 0.815000000018486 | 0 | 0 | 0 |
| 0.815500000018436 | 0 | 0 | 0 |
| 0.816000000018386 | 0 | 0 | 0 |
| 0.816500000018336 | 0 | 0 | 0 |
| 0.817000000018286 | 0 | 0 | 0 |
| 0.817500000018236 | 0 | 0 | 0 |
| 0.818000000018186 | 0 | 0 | 0 |
| 0.818500000018136 | 0 | 0 | 0 |
| 0.819000000018086 | 0 | 0 | 0 |
| 0.819500000018036 | 0 | 0 | 0 |
| 0.820000000017986 | 0 | 0 | 0 |
| 0.820500000017936 | 0 | 0 | 0 |
| 0.821000000017886 | 0 | 0 | 0 |
| 0.821500000017836 | 0 | 0 | 0 |
| 0.822000000017786 | 0 | 0 | 0 |
| 0.822500000017736 | 0 | 0 | 0 |
| 0.823000000017686 | 0 | 0 | 0 |
| 0.823500000017636 | 0 | 0 | 0 |
| 0.824000000017586 | 0 | 0 | 0 |
| 0.824500000017535 | 0 | 0 | 0 |
| 0.825000000017485 | 0 | 0 | 0 |
| 0.825500000017435 | 0 | 0 | 0 |
| 0.826000000017385 | 0 | 0 | 0 |
| 0.826500000017335 | 0 | 0 | 0 |
| 0.827000000017285 | 0 | 0 | 0 |
| 0.827500000017235 | 0 | 0 | 0 |
| 0.828000000017185 | 0 | 0 | 0 |
| 0.828500000017135 | 0 | 0 | 0 |
| 0.829000000017085 | 0 | 0 | 0 |
| 0.829500000017035 | 0 | 0 | 0 |
| 0.830000000016985 | 0 | 0 | 0 |
| 0.830500000016935 | 0 | 0 | 0 |
| 0.831000000016885 | 0 | 0 | 0 |
| 0.831500000016835 | 0 | 0 | 0 |
| 0.832000000016785 | 0 | 0 | 0 |
| 0.832500000016735 | 0 | 0 | 0 |
| 0.833000000016685 | 0 | 0 | 0 |
| 0.833500000016635 | 0 | 0 | 0 |
| 0.834000000016585 | 0 | 0 | 0 |
| 0.834500000016535 | 0 | 0 | 0 |
| 0.835000000016485 | 0 | 0 | 0 |
| 0.835500000016435 | 0 | 0 | 0 |
| 0.836000000016385 | 0 | 0 | 0 |
| 0.836500000016335 | 0 | 0 | 0 |
| 0.837000000016285 | 0 | 0 | 0 |
| 0.837500000016235 | 0 | 0 | 0 |
| 0.838000000016185 | 0 | 0 | 0 |
| 0.838500000016135 | 0 | 0 | 0 |
| 0.839000000016085 | 0 | 0 | 0 |
| 0.839500000016035 | 0 | 0 | 0 |
| 0.840000000015985 | 0 | 0 | 0 |
| 0.840500000015935 | 0 | 0 | 0 |
| 0.841000000015885 | 0 | 0 | 0 |
| 0.841500000015835 | 0 | 0 | 0 |
| 0.842000000015785 | 0 | 0 | 0 |
| 0.842500000015735 | 0 | 0 | 0 |
| 0.843000000015685 | 0 | 0 | 0 |
| 0.843500000015635 | 0 | 0 | 0 |
| 0.844000000015585 | 0 | 0 | 0 |
| 0.844500000015535 | 0 | 0 | 0 |
| 0.845000000015485 | 0 | 0 | 0 |
| 0.845500000015435 | 0 | 0 | 0 |
| 0.846000000015385 | 0 | 0 | 0 |
| 0.846500000015335 | 0 | 0 | 0 |
| 0.847000000015285 | 0 | 0 | 0 |
| 0.847500000015235 | 0 | 0 | 0 |
| 0.848000000015185 | 0 | 0 | 0 |
| 0.848500000015135 | 0 | 0 | 0 |
| 0.849000000015085 | 0 | 0 | 0 |
| 0.849500000015035 | 0 | 0 | 0 |
| 0.850000000014985 | 0 | 0 | 0 |
| 0.850500000014935 | 0 | 0 | 0 |
| 0.851000000014885 | 0 | 0 | 0 |
| 0.851500000014835 | 0 | 0 | 0 |
| 0.852000000014785 | 0 | 0 | 0 |
| 0.852500000014735 | 0 | 0 | 0 |
| 0.853000000014685 | 0 | 0 | 0 |
| 0.853500000014635 | 0 | 0 | 0 |
| 0.854000000014585 | 0 | 0 | 0 |
| 0.854500000014535 | 0 | 0 | 0 |
| 0.855000000014485 | 0 | 0 | 0 |
| 0.855500000014435 | 0 | 0 | 0 |
| 0.856000000014385 | 0 | 0 | 0 |
| 0.856500000014335 | 0 | 0 | 0 |
| 0.857000000014285 | 0 | 0 | 0 |
| 0.857500000014234 | 0 | 0 | 0 |
| 0.858000000014184 | 0 | 0 | 0 |
| 0.858500000014134 | 0 | 0 | 0 |
| 0.859000000014084 | 0 | 0 | 0 |
| 0.859500000014034 | 0 | 0 | 0 |
| 0.860000000013984 | 0 | 0 | 0 |
| 0.860500000013934 | 0 | 0 | 0 |
| 0.861000000013884 | 0 | 0 | 0 |
| 0.861500000013834 | 0 | 0 | 0 |
| 0.862000000013784 | 0 | 0 | 0 |
| 0.862500000013734 | 0 | 0 | 0 |
| 0.863000000013684 | 0 | 0 | 0 |
| 0.863500000013634 | 0 | 0 | 0 |
| 0.864000000013584 | 0 | 0 | 0 |
| 0.864500000013534 | 0 | 0 | 0 |
| 0.865000000013484 | 0 | 0 | 0 |
| 0.865500000013434 | 0 | 0 | 0 |
| 0.866000000013384 | 0 | 0 | 0 |
| 0.866500000013334 | 0 | 0 | 0 |
| 0.867000000013284 | 0 | 0 | 0 |
| 0.867500000013234 | 0 | 0 | 0 |
| 0.868000000013184 | 0 | 0 | 0 |
| 0.868500000013134 | 0 | 0 | 0 |
| 0.869000000013084 | 0 | 0 | 0 |
| 0.869500000013034 | 0 | 0 | 0 |
| 0.870000000012984 | 0 | 0 | 0 |
| 0.870500000012934 | 0 | 0 | 0 |
| 0.871000000012884 | 0 | 0 | 0 |
| 0.871500000012834 | 0 | 0 | 0 |
| 0.872000000012784 | 0 | 0 | 0 |
| 0.872500000012734 | 0 | 0 | 0 |
| 0.873000000012684 | 0 | 0 | 0 |
| 0.873500000012634 | 0 | 0 | 0 |
| 0.874000000012584 | 0 | 0 | 0 |
| 0.874500000012534 | 0 | 0 | 0 |
| 0.875000000012484 | 0 | 0 | 0 |
| 0.875500000012434 | 0 | 0 | 0 |
| 0.876000000012384 | 0 | 0 | 0 |
| 0.876500000012334 | 0 | 0 | 0 |
| 0.877000000012284 | 0 | 0 | 0 |
| 0.877500000012234 | 0 | 0 | 0 |
| 0.878000000012184 | 0 | 0 | 0 |
| 0.878500000012134 | 0 | 0 | 0 |
| 0.879000000012084 | 0 | 0 | 0 |
| 0.879500000012034 | 0 | 0 | 0 |
| 0.880000000011984 | 0 | 0 | 0 |
| 0.880500000011934 | 0 | 0 | 0 |
| 0.881000000011884 | 0 | 0 | 0 |
| 0.881500000011834 | 0 | 0 | 0 |
| 0.882000000011784 | 0 | 0 | 0 |
| 0.882500000011734 | 0 | 0 | 0 |
| 0.883000000011684 | 0 | 0 | 0 |
| 0.883500000011634 | 0 | 0 | 0 |
| 0.884000000011584 | 0 | 0 | 0 |
| 0.884500000011534 | 0 | 0 | 0 |
| 0.885000000011484 | 0 | 0 | 0 |
| 0.885500000011434 | 0 | 0 | 0 |
| 0.886000000011384 | 0 | 0 | 0 |
| 0.886500000011334 | 0 | 0 | 0 |
| 0.887000000011284 | 0 | 0 | 0 |
| 0.887500000011234 | 0 | 0 | 0 |
| 0.888000000011184 | 0 | 0 | 0 |
| 0.888500000011134 | 0 | 0 | 0 |
| 0.889000000011084 | 0 | 0 | 0 |
| 0.889500000011034 | 0 | 0 | 0 |
| 0.890000000010983 | 0 | 0 | 0 |
| 0.890500000010933 | 0 | 0 | 0 |
| 0.891000000010883 | 0 | 0 | 0 |
| 0.891500000010833 | 0 | 0 | 0 |
| 0.892000000010783 | 0 | 0 | 0 |
| 0.892500000010733 | 0 | 0 | 0 |
| 0.893000000010683 | 0 | 0 | 0 |
| 0.893500000010633 | 0 | 0 | 0 |
| 0.894000000010583 | 0 | 0 | 0 |
| 0.894500000010533 | 0 | 0 | 0 |
| 0.895000000010483 | 0 | 0 | 0 |
| 0.895500000010433 | 0 | 0 | 0 |
| 0.896000000010383 | 0 | 0 | 0 |
| 0.896500000010333 | 0 | 0 | 0 |
| 0.897000000010283 | 0 | 0 | 0 |
| 0.897500000010233 | 0 | 0 | 0 |
| 0.898000000010183 | 0 | 0 | 0 |
| 0.898500000010133 | 0 | 0 | 0 |
| 0.899000000010083 | 0 | 0 | 0 |
| 0.899500000010033 | 0 | 0 | 0 |
| 0.900000000009983 | 0 | 0 | 0 |
| 0.900500000009933 | 0 | 0 | 0 |
| 0.901000000009883 | 0 | 0 | 0 |
| 0.901500000009833 | 0 | 0 | 0 |
| 0.902000000009783 | 0 | 0 | 0 |
| 0.902500000009733 | 0 | 0 | 0 |
| 0.903000000009683 | 0 | 0 | 0 |
| 0.903500000009633 | 0 | 0 | 0 |
| 0.904000000009583 | 0 | 0 | 0 |
| 0.904500000009533 | 0 | 0 | 0 |
| 0.905000000009483 | 0 | 0 | 0 |
| 0.905500000009433 | 0 | 0 | 0 |
| 0.906000000009383 | 0 | 0 | 0 |
| 0.906500000009333 | 0 | 0 | 0 |
| 0.907000000009283 | 0 | 0 | 0 |
| 0.907500000009233 | 0 | 0 | 0 |
| 0.908000000009183 | 0 | 0 | 0 |
| 0.908500000009133 | 0 | 0 | 0 |
| 0.909000000009083 | 0 | 0 | 0 |
| 0.909500000009033 | 0 | 0 | 0 |
| 0.910000000008983 | 0 | 0 | 0 |
| 0.910500000008933 | 0 | 0 | 0 |
| 0.911000000008883 | 0 | 0 | 0 |
| 0.911500000008833 | 0 | 0 | 0 |
| 0.912000000008783 | 0 | 0 | 0 |
| 0.912500000008733 | 0 | 0 | 0 |
| 0.913000000008683 | 0 | 0 | 0 |
| 0.913500000008633 | 0 | 0 | 0 |
| 0.914000000008583 | 0 | 0 | 0 |
| 0.914500000008533 | 0 | 0 | 0 |
| 0.915000000008483 | 0 | 0 | 0 |
| 0.915500000008433 | 0 | 0 | 0 |
| 0.916000000008383 | 0 | 0 | 0 |
| 0.916500000008333 | 0 | 0 | 0 |
| 0.917000000008283 | 0 | 0 | 0 |
| 0.917500000008233 | 0 | 0 | 0 |
| 0.918000000008183 | 0 | 0 | 0 |
| 0.918500000008133 | 0 | 0 | 0 |
| 0.919000000008083 | 0 | 0 | 0 |
| 0.919500000008033 | 0 | 0 | 0 |
| 0.920000000007983 | 0 | 0 | 0 |
| 0.920500000007933 | 0 | 0 | 0 |
| 0.921000000007883 | 0 | 0 | 0 |
| 0.921500000007833 | 0 | 0 | 0 |
| 0.922000000007783 | 0 | 0 | 0 |
| 0.922500000007733 | 0 | 0 | 0 |
| 0.923000000007683 | 0 | 0 | 0 |
| 0.923500000007633 | 0 | 0 | 0 |
| 0.924000000007583 | 0 | 0 | 0 |
| 0.924500000007532 | 0 | 0 | 0 |
| 0.925000000007482 | 0 | 0 | 0 |
| 0.925500000007432 | 0 | 0 | 0 |
| 0.926000000007382 | 0 | 0 | 0 |
| 0.926500000007332 | 0 | 0 | 0 |
| 0.927000000007282 | 0 | 0 | 0 |
| 0.927500000007232 | 0 | 0 | 0 |
| 0.928000000007182 | 0 | 0 | 0 |
| 0.928500000007132 | 0 | 0 | 0 |
| 0.929000000007082 | 0 | 0 | 0 |
| 0.929500000007032 | 0 | 0 | 0 |
| 0.930000000006982 | 0 | 0 | 0 |
| 0.930500000006932 | 0 | 0 | 0 |
| 0.931000000006882 | 0 | 0 | 0 |
| 0.931500000006832 | 0 | 0 | 0 |
| 0.932000000006782 | 0 | 0 | 0 |
| 0.932500000006732 | 0 | 0 | 0 |
| 0.933000000006682 | 0 | 0 | 0 |
| 0.933500000006632 | 0 | 0 | 0 |
| 0.934000000006582 | 0 | 0 | 0 |
| 0.934500000006532 | 0 | 0 | 0 |
| 0.935000000006482 | 0 | 0 | 0 |
| 0.935500000006432 | 0 | 0 | 0 |
| 0.936000000006382 | 0 | 0 | 0 |
| 0.936500000006332 | 0 | 0 | 0 |
| 0.937000000006282 | 0 | 0 | 0 |
| 0.937500000006232 | 0 | 0 | 0 |
| 0.938000000006182 | 0 | 0 | 0 |
| 0.938500000006132 | 0 | 0 | 0 |
| 0.939000000006082 | 0 | 0 | 0 |
| 0.939500000006032 | 0 | 0 | 0 |
| 0.940000000005982 | 0 | 0 | 0 |
| 0.940500000005932 | 0 | 0 | 0 |
| 0.941000000005882 | 0 | 0 | 0 |
| 0.941500000005832 | 0 | 0 | 0 |
| 0.942000000005782 | 0 | 0 | 0 |
| 0.942500000005732 | 0 | 0 | 0 |
| 0.943000000005682 | 0 | 0 | 0 |
| 0.943500000005632 | 0 | 0 | 0 |
| 0.944000000005582 | 0 | 0 | 0 |
| 0.944500000005532 | 0 | 0 | 0 |
| 0.945000000005482 | 0 | 0 | 0 |
| 0.945500000005432 | 0 | 0 | 0 |
| 0.946000000005382 | 0 | 0 | 0 |
| 0.946500000005332 | 0 | 0 | 0 |
| 0.947000000005282 | 0 | 0 | 0 |
| 0.947500000005232 | 0 | 0 | 0 |
| 0.948000000005182 | 0 | 0 | 0 |
| 0.948500000005132 | 0 | 0 | 0 |
| 0.949000000005082 | 0 | 0 | 0 |
| 0.949500000005032 | 0 | 0 | 0 |
| 0.950000000004982 | 0 | 0 | 0 |
| 0.950500000004932 | 0 | 0 | 0 |
| 0.951000000004882 | 0 | 0 | 0 |
| 0.951500000004832 | 0 | 0 | 0 |
| 0.952000000004782 | 0 | 0 | 0 |
| 0.952500000004732 | 0 | 0 | 0 |
| 0.953000000004682 | 0 | 0 | 0 |
| 0.953500000004632 | 0 | 0 | 0 |
| 0.954000000004582 | 0 | 0 | 0 |
| 0.954500000004532 | 0 | 0 | 0 |
| 0.955000000004482 | 0 | 0 | 0 |
| 0.955500000004432 | 0 | 0 | 0 |
| 0.956000000004382 | 0 | 0 | 0 |
| 0.956500000004332 | 0 | 0 | 0 |
| 0.957000000004282 | 0 | 0 | 0 |
| 0.957500000004231 | 0 | 0 | 0 |
| 0.958000000004181 | 0 | 0 | 0 |
| 0.958500000004131 | 0 | 0 | 0 |
| 0.959000000004081 | 0 | 0 | 0 |
| 0.959500000004031 | 0 | 0 | 0 |
| 0.960000000003981 | 0 | 0 | 0 |
| 0.960500000003931 | 0 | 0 | 0 |
| 0.961000000003881 | 0 | 0 | 0 |
| 0.961500000003831 | 0 | 0 | 0 |
| 0.962000000003781 | 0 | 0 | 0 |
| 0.962500000003731 | 0 | 0 | 0 |
| 0.963000000003681 | 0 | 0 | 0 |
| 0.963500000003631 | 0 | 0 | 0 |
| 0.964000000003581 | 0 | 0 | 0 |
| 0.964500000003531 | 0 | 0 | 0 |
| 0.965000000003481 | 0 | 0 | 0 |
| 0.965500000003431 | 0 | 0 | 0 |
| 0.966000000003381 | 0 | 0 | 0 |
| 0.966500000003331 | 0 | 0 | 0 |
| 0.967000000003281 | 0 | 0 | 0 |
| 0.967500000003231 | 0 | 0 | 0 |
| 0.968000000003181 | 0 | 0 | 0 |
| 0.968500000003131 | 0 | 0 | 0 |
| 0.969000000003081 | 0 | 0 | 0 |
| 0.969500000003031 | 0 | 0 | 0 |
| 0.970000000002981 | 0 | 0 | 0 |
| 0.970500000002931 | 0 | 0 | 0 |
| 0.971000000002881 | 0 | 0 | 0 |
| 0.971500000002831 | 0 | 0 | 0 |
| 0.972000000002781 | 0 | 0 | 0 |
| 0.972500000002731 | 0 | 0 | 0 |
| 0.973000000002681 | 0 | 0 | 0 |
| 0.973500000002631 | 0 | 0 | 0 |
| 0.974000000002581 | 0 | 0 | 0 |
| 0.974500000002531 | 0 | 0 | 0 |
| 0.975000000002481 | 0 | 0 | 0 |
| 0.975500000002431 | 0 | 0 | 0 |
| 0.976000000002381 | 0 | 0 | 0 |
| 0.976500000002331 | 0 | 0 | 0 |
| 0.977000000002281 | 0 | 0 | 0 |
| 0.977500000002231 | 0 | 0 | 0 |
| 0.978000000002181 | 0 | 0 | 0 |
| 0.978500000002131 | 0 | 0 | 0 |
| 0.979000000002081 | 0 | 0 | 0 |
| 0.979500000002031 | 0 | 0 | 0 |
| 0.980000000001981 | 0 | 0 | 0 |
| 0.980500000001931 | 0 | 0 | 0 |
| 0.981000000001881 | 0 | 0 | 0 |
| 0.981500000001831 | 0 | 0 | 0 |
| 0.982000000001781 | 0 | 0 | 0 |
| 0.982500000001731 | 0 | 0 | 0 |
| 0.983000000001681 | 0 | 0 | 0 |
| 0.983500000001631 | 0 | 0 | 0 |
| 0.984000000001581 | 0 | 0 | 0 |
| 0.984500000001531 | 0 | 0 | 0 |
| 0.985000000001481 | 0 | 0 | 0 |
| 0.985500000001431 | 0 | 0 | 0 |
| 0.986000000001381 | 0 | 0 | 0 |
| 0.986500000001331 | 0 | 0 | 0 |
| 0.987000000001281 | 0 | 0 | 0 |
| 0.987500000001231 | 0 | 0 | 0 |
| 0.988000000001181 | 0 | 0 | 0 |
| 0.988500000001131 | 0 | 0 | 0 |
| 0.989000000001081 | 0 | 0 | 0 |
| 0.989500000001031 | 0 | 0 | 0 |
| 0.99000000000098 | 0 | 0 | 0 |
| 0.99050000000093 | 0 | 0 | 0 |
| 0.99100000000088 | 0 | 0 | 0 |
| 0.99150000000083 | 0 | 0 | 0 |
| 0.99200000000078 | 0 | 0 | 0 |
| 0.99250000000073 | 0 | 0 | 0 |
| 0.99300000000068 | 0 | 0 | 0 |
| 0.99350000000063 | 0 | 0 | 0 |
| 0.99400000000058 | 0 | 0 | 0 |
| 0.99450000000053 | 0 | 0 | 0 |
| 0.99500000000048 | 0 | 0 | 0 |
| 0.99550000000043 | 0 | 0 | 0 |
| 0.99600000000038 | 0 | 0 | 0 |
| 0.99650000000033 | 0 | 0 | 0 |
| 0.99700000000028 | 0 | 0 | 0 |
| 0.99750000000023 | 0 | 0 | 0 |
| 0.99800000000018 | 0 | 0 | 0 |
| 0.99850000000013 | 0 | 0 | 0 |
| 0.99900000000008 | 0 | 0 | 0 |
| 0.99950000000003 | 0 | 0 | 0 |
| 0.99999999999998 | 0 | 0 | 0 |